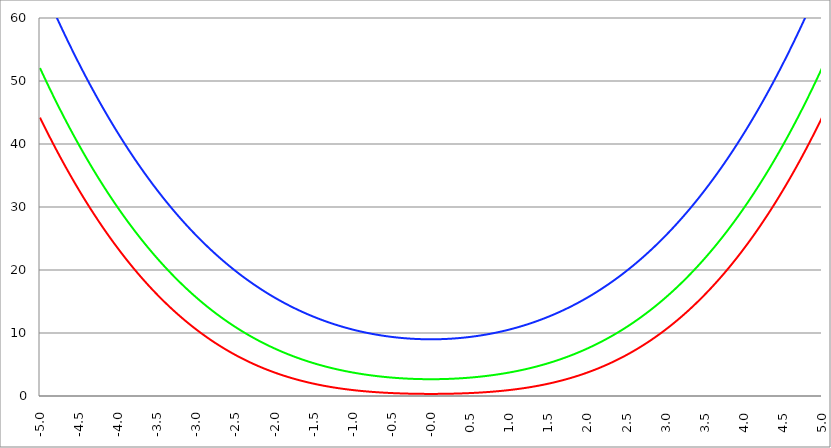
| Category | Series 1 | Series 0 | Series 2 |
|---|---|---|---|
| -5.0 | 44.192 | 52.057 | 66.084 |
| -4.995 | 44.064 | 51.922 | 65.938 |
| -4.99 | 43.937 | 51.788 | 65.793 |
| -4.985 | 43.81 | 51.654 | 65.648 |
| -4.98 | 43.684 | 51.52 | 65.503 |
| -4.975 | 43.557 | 51.387 | 65.358 |
| -4.97 | 43.431 | 51.253 | 65.214 |
| -4.965000000000001 | 43.305 | 51.12 | 65.07 |
| -4.960000000000001 | 43.18 | 50.988 | 64.926 |
| -4.955000000000001 | 43.054 | 50.855 | 64.782 |
| -4.950000000000001 | 42.929 | 50.723 | 64.639 |
| -4.945000000000001 | 42.804 | 50.591 | 64.496 |
| -4.940000000000001 | 42.68 | 50.459 | 64.353 |
| -4.935000000000001 | 42.555 | 50.328 | 64.21 |
| -4.930000000000001 | 42.431 | 50.196 | 64.068 |
| -4.925000000000002 | 42.307 | 50.065 | 63.926 |
| -4.920000000000002 | 42.184 | 49.934 | 63.784 |
| -4.915000000000002 | 42.06 | 49.804 | 63.642 |
| -4.910000000000002 | 41.937 | 49.674 | 63.501 |
| -4.905000000000002 | 41.814 | 49.544 | 63.36 |
| -4.900000000000002 | 41.692 | 49.414 | 63.219 |
| -4.895000000000002 | 41.569 | 49.284 | 63.078 |
| -4.890000000000002 | 41.447 | 49.155 | 62.938 |
| -4.885000000000002 | 41.325 | 49.026 | 62.798 |
| -4.880000000000002 | 41.204 | 48.897 | 62.658 |
| -4.875000000000003 | 41.082 | 48.769 | 62.518 |
| -4.870000000000003 | 40.961 | 48.64 | 62.379 |
| -4.865000000000003 | 40.84 | 48.512 | 62.24 |
| -4.860000000000003 | 40.719 | 48.384 | 62.101 |
| -4.855000000000003 | 40.599 | 48.257 | 61.962 |
| -4.850000000000003 | 40.479 | 48.129 | 61.824 |
| -4.845000000000003 | 40.359 | 48.002 | 61.685 |
| -4.840000000000003 | 40.239 | 47.875 | 61.548 |
| -4.835000000000003 | 40.119 | 47.749 | 61.41 |
| -4.830000000000004 | 40 | 47.622 | 61.272 |
| -4.825000000000004 | 39.881 | 47.496 | 61.135 |
| -4.820000000000004 | 39.762 | 47.37 | 60.998 |
| -4.815000000000004 | 39.644 | 47.245 | 60.862 |
| -4.810000000000004 | 39.526 | 47.119 | 60.725 |
| -4.805000000000004 | 39.408 | 46.994 | 60.589 |
| -4.800000000000004 | 39.29 | 46.869 | 60.453 |
| -4.795000000000004 | 39.172 | 46.745 | 60.317 |
| -4.790000000000004 | 39.055 | 46.62 | 60.182 |
| -4.785000000000004 | 38.938 | 46.496 | 60.046 |
| -4.780000000000004 | 38.821 | 46.372 | 59.911 |
| -4.775000000000004 | 38.704 | 46.248 | 59.777 |
| -4.770000000000004 | 38.588 | 46.125 | 59.642 |
| -4.765000000000005 | 38.472 | 46.002 | 59.508 |
| -4.760000000000005 | 38.356 | 45.879 | 59.374 |
| -4.755000000000005 | 38.24 | 45.756 | 59.24 |
| -4.750000000000005 | 38.125 | 45.633 | 59.107 |
| -4.745000000000005 | 38.01 | 45.511 | 58.973 |
| -4.740000000000005 | 37.895 | 45.389 | 58.84 |
| -4.735000000000005 | 37.78 | 45.267 | 58.707 |
| -4.730000000000005 | 37.666 | 45.146 | 58.575 |
| -4.725000000000006 | 37.552 | 45.024 | 58.442 |
| -4.720000000000006 | 37.438 | 44.903 | 58.31 |
| -4.715000000000006 | 37.324 | 44.782 | 58.178 |
| -4.710000000000006 | 37.21 | 44.662 | 58.047 |
| -4.705000000000006 | 37.097 | 44.541 | 57.915 |
| -4.700000000000006 | 36.984 | 44.421 | 57.784 |
| -4.695000000000006 | 36.871 | 44.301 | 57.653 |
| -4.690000000000006 | 36.759 | 44.182 | 57.523 |
| -4.685000000000007 | 36.646 | 44.062 | 57.392 |
| -4.680000000000007 | 36.534 | 43.943 | 57.262 |
| -4.675000000000007 | 36.422 | 43.824 | 57.132 |
| -4.670000000000007 | 36.311 | 43.705 | 57.002 |
| -4.665000000000007 | 36.199 | 43.587 | 56.873 |
| -4.660000000000007 | 36.088 | 43.468 | 56.744 |
| -4.655000000000007 | 35.977 | 43.35 | 56.615 |
| -4.650000000000007 | 35.867 | 43.233 | 56.486 |
| -4.645000000000007 | 35.756 | 43.115 | 56.357 |
| -4.640000000000008 | 35.646 | 42.998 | 56.229 |
| -4.635000000000008 | 35.536 | 42.881 | 56.101 |
| -4.630000000000008 | 35.426 | 42.764 | 55.973 |
| -4.625000000000008 | 35.317 | 42.647 | 55.846 |
| -4.620000000000008 | 35.207 | 42.531 | 55.718 |
| -4.615000000000008 | 35.098 | 42.414 | 55.591 |
| -4.610000000000008 | 34.989 | 42.299 | 55.464 |
| -4.605000000000008 | 34.881 | 42.183 | 55.337 |
| -4.600000000000008 | 34.772 | 42.067 | 55.211 |
| -4.595000000000009 | 34.664 | 41.952 | 55.085 |
| -4.590000000000009 | 34.556 | 41.837 | 54.959 |
| -4.585000000000009 | 34.449 | 41.722 | 54.833 |
| -4.580000000000009 | 34.341 | 41.608 | 54.708 |
| -4.57500000000001 | 34.234 | 41.493 | 54.582 |
| -4.57000000000001 | 34.127 | 41.379 | 54.457 |
| -4.565000000000009 | 34.02 | 41.265 | 54.333 |
| -4.560000000000009 | 33.913 | 41.152 | 54.208 |
| -4.555000000000009 | 33.807 | 41.038 | 54.084 |
| -4.55000000000001 | 33.701 | 40.925 | 53.96 |
| -4.54500000000001 | 33.595 | 40.812 | 53.836 |
| -4.54000000000001 | 33.49 | 40.699 | 53.712 |
| -4.53500000000001 | 33.384 | 40.587 | 53.589 |
| -4.53000000000001 | 33.279 | 40.475 | 53.465 |
| -4.52500000000001 | 33.174 | 40.363 | 53.342 |
| -4.52000000000001 | 33.069 | 40.251 | 53.22 |
| -4.51500000000001 | 32.965 | 40.139 | 53.097 |
| -4.51000000000001 | 32.86 | 40.028 | 52.975 |
| -4.505000000000011 | 32.756 | 39.917 | 52.853 |
| -4.500000000000011 | 32.653 | 39.806 | 52.731 |
| -4.495000000000011 | 32.549 | 39.695 | 52.61 |
| -4.490000000000011 | 32.446 | 39.585 | 52.488 |
| -4.485000000000011 | 32.342 | 39.474 | 52.367 |
| -4.480000000000011 | 32.239 | 39.364 | 52.246 |
| -4.475000000000011 | 32.137 | 39.255 | 52.126 |
| -4.470000000000011 | 32.034 | 39.145 | 52.005 |
| -4.465000000000011 | 31.932 | 39.036 | 51.885 |
| -4.460000000000011 | 31.83 | 38.927 | 51.765 |
| -4.455000000000012 | 31.728 | 38.818 | 51.645 |
| -4.450000000000012 | 31.627 | 38.709 | 51.526 |
| -4.445000000000012 | 31.525 | 38.601 | 51.406 |
| -4.440000000000012 | 31.424 | 38.492 | 51.287 |
| -4.435000000000012 | 31.323 | 38.384 | 51.168 |
| -4.430000000000012 | 31.222 | 38.277 | 51.05 |
| -4.425000000000012 | 31.122 | 38.169 | 50.931 |
| -4.420000000000012 | 31.022 | 38.062 | 50.813 |
| -4.415000000000012 | 30.922 | 37.955 | 50.695 |
| -4.410000000000013 | 30.822 | 37.848 | 50.578 |
| -4.405000000000013 | 30.722 | 37.741 | 50.46 |
| -4.400000000000013 | 30.623 | 37.635 | 50.343 |
| -4.395000000000013 | 30.524 | 37.528 | 50.226 |
| -4.390000000000013 | 30.425 | 37.422 | 50.109 |
| -4.385000000000013 | 30.326 | 37.317 | 49.992 |
| -4.380000000000013 | 30.228 | 37.211 | 49.876 |
| -4.375000000000013 | 30.129 | 37.106 | 49.76 |
| -4.370000000000013 | 30.031 | 37.001 | 49.644 |
| -4.365000000000013 | 29.933 | 36.896 | 49.528 |
| -4.360000000000014 | 29.836 | 36.791 | 49.413 |
| -4.355000000000014 | 29.738 | 36.687 | 49.297 |
| -4.350000000000014 | 29.641 | 36.582 | 49.182 |
| -4.345000000000014 | 29.544 | 36.478 | 49.068 |
| -4.340000000000014 | 29.447 | 36.375 | 48.953 |
| -4.335000000000014 | 29.351 | 36.271 | 48.839 |
| -4.330000000000014 | 29.255 | 36.168 | 48.725 |
| -4.325000000000014 | 29.158 | 36.064 | 48.611 |
| -4.320000000000014 | 29.063 | 35.961 | 48.497 |
| -4.315000000000015 | 28.967 | 35.859 | 48.383 |
| -4.310000000000015 | 28.871 | 35.756 | 48.27 |
| -4.305000000000015 | 28.776 | 35.654 | 48.157 |
| -4.300000000000015 | 28.681 | 35.552 | 48.044 |
| -4.295000000000015 | 28.586 | 35.45 | 47.932 |
| -4.290000000000015 | 28.492 | 35.348 | 47.819 |
| -4.285000000000015 | 28.397 | 35.247 | 47.707 |
| -4.280000000000015 | 28.303 | 35.146 | 47.595 |
| -4.275000000000015 | 28.209 | 35.045 | 47.483 |
| -4.270000000000015 | 28.116 | 34.944 | 47.372 |
| -4.265000000000016 | 28.022 | 34.843 | 47.26 |
| -4.260000000000016 | 27.929 | 34.743 | 47.149 |
| -4.255000000000016 | 27.836 | 34.643 | 47.038 |
| -4.250000000000016 | 27.743 | 34.543 | 46.928 |
| -4.245000000000016 | 27.65 | 34.443 | 46.817 |
| -4.240000000000016 | 27.558 | 34.344 | 46.707 |
| -4.235000000000016 | 27.465 | 34.245 | 46.597 |
| -4.230000000000016 | 27.373 | 34.146 | 46.487 |
| -4.225000000000017 | 27.281 | 34.047 | 46.378 |
| -4.220000000000017 | 27.19 | 33.948 | 46.268 |
| -4.215000000000017 | 27.098 | 33.85 | 46.159 |
| -4.210000000000017 | 27.007 | 33.751 | 46.05 |
| -4.205000000000017 | 26.916 | 33.653 | 45.942 |
| -4.200000000000017 | 26.825 | 33.556 | 45.833 |
| -4.195000000000017 | 26.735 | 33.458 | 45.725 |
| -4.190000000000017 | 26.645 | 33.361 | 45.617 |
| -4.185000000000017 | 26.554 | 33.263 | 45.509 |
| -4.180000000000017 | 26.465 | 33.166 | 45.401 |
| -4.175000000000018 | 26.375 | 33.07 | 45.294 |
| -4.170000000000018 | 26.285 | 32.973 | 45.187 |
| -4.165000000000018 | 26.196 | 32.877 | 45.08 |
| -4.160000000000018 | 26.107 | 32.781 | 44.973 |
| -4.155000000000018 | 26.018 | 32.685 | 44.866 |
| -4.150000000000018 | 25.929 | 32.589 | 44.76 |
| -4.145000000000018 | 25.841 | 32.494 | 44.654 |
| -4.140000000000018 | 25.753 | 32.398 | 44.548 |
| -4.135000000000018 | 25.664 | 32.303 | 44.442 |
| -4.130000000000019 | 25.577 | 32.208 | 44.337 |
| -4.125000000000019 | 25.489 | 32.114 | 44.231 |
| -4.120000000000019 | 25.402 | 32.019 | 44.126 |
| -4.115000000000019 | 25.314 | 31.925 | 44.021 |
| -4.110000000000019 | 25.227 | 31.831 | 43.917 |
| -4.105000000000019 | 25.14 | 31.737 | 43.812 |
| -4.100000000000019 | 25.054 | 31.644 | 43.708 |
| -4.095000000000019 | 24.967 | 31.55 | 43.604 |
| -4.090000000000019 | 24.881 | 31.457 | 43.5 |
| -4.085000000000019 | 24.795 | 31.364 | 43.396 |
| -4.08000000000002 | 24.709 | 31.271 | 43.293 |
| -4.07500000000002 | 24.624 | 31.179 | 43.19 |
| -4.07000000000002 | 24.538 | 31.086 | 43.087 |
| -4.06500000000002 | 24.453 | 30.994 | 42.984 |
| -4.06000000000002 | 24.368 | 30.902 | 42.881 |
| -4.05500000000002 | 24.284 | 30.81 | 42.779 |
| -4.05000000000002 | 24.199 | 30.719 | 42.677 |
| -4.04500000000002 | 24.115 | 30.627 | 42.575 |
| -4.04000000000002 | 24.03 | 30.536 | 42.473 |
| -4.03500000000002 | 23.946 | 30.445 | 42.372 |
| -4.03000000000002 | 23.863 | 30.355 | 42.27 |
| -4.025000000000021 | 23.779 | 30.264 | 42.169 |
| -4.020000000000021 | 23.696 | 30.174 | 42.068 |
| -4.015000000000021 | 23.613 | 30.083 | 41.968 |
| -4.010000000000021 | 23.53 | 29.994 | 41.867 |
| -4.005000000000021 | 23.447 | 29.904 | 41.767 |
| -4.000000000000021 | 23.364 | 29.814 | 41.667 |
| -3.995000000000021 | 23.282 | 29.725 | 41.567 |
| -3.990000000000021 | 23.2 | 29.636 | 41.467 |
| -3.985000000000022 | 23.118 | 29.547 | 41.368 |
| -3.980000000000022 | 23.036 | 29.458 | 41.268 |
| -3.975000000000022 | 22.954 | 29.37 | 41.169 |
| -3.970000000000022 | 22.873 | 29.281 | 41.07 |
| -3.965000000000022 | 22.792 | 29.193 | 40.972 |
| -3.960000000000022 | 22.711 | 29.105 | 40.873 |
| -3.955000000000022 | 22.63 | 29.017 | 40.775 |
| -3.950000000000022 | 22.55 | 28.93 | 40.677 |
| -3.945000000000022 | 22.469 | 28.842 | 40.579 |
| -3.940000000000023 | 22.389 | 28.755 | 40.481 |
| -3.935000000000023 | 22.309 | 28.668 | 40.384 |
| -3.930000000000023 | 22.229 | 28.582 | 40.287 |
| -3.925000000000023 | 22.15 | 28.495 | 40.19 |
| -3.920000000000023 | 22.07 | 28.409 | 40.093 |
| -3.915000000000023 | 21.991 | 28.323 | 39.996 |
| -3.910000000000023 | 21.912 | 28.237 | 39.9 |
| -3.905000000000023 | 21.833 | 28.151 | 39.803 |
| -3.900000000000023 | 21.755 | 28.065 | 39.707 |
| -3.895000000000023 | 21.676 | 27.98 | 39.612 |
| -3.890000000000024 | 21.598 | 27.895 | 39.516 |
| -3.885000000000024 | 21.52 | 27.81 | 39.42 |
| -3.880000000000024 | 21.442 | 27.725 | 39.325 |
| -3.875000000000024 | 21.365 | 27.64 | 39.23 |
| -3.870000000000024 | 21.287 | 27.556 | 39.135 |
| -3.865000000000024 | 21.21 | 27.472 | 39.041 |
| -3.860000000000024 | 21.133 | 27.388 | 38.946 |
| -3.855000000000024 | 21.056 | 27.304 | 38.852 |
| -3.850000000000024 | 20.979 | 27.22 | 38.758 |
| -3.845000000000025 | 20.903 | 27.137 | 38.664 |
| -3.840000000000025 | 20.827 | 27.054 | 38.57 |
| -3.835000000000025 | 20.75 | 26.971 | 38.477 |
| -3.830000000000025 | 20.675 | 26.888 | 38.384 |
| -3.825000000000025 | 20.599 | 26.805 | 38.291 |
| -3.820000000000025 | 20.523 | 26.723 | 38.198 |
| -3.815000000000025 | 20.448 | 26.641 | 38.105 |
| -3.810000000000025 | 20.373 | 26.558 | 38.013 |
| -3.805000000000025 | 20.298 | 26.477 | 37.92 |
| -3.800000000000026 | 20.223 | 26.395 | 37.828 |
| -3.795000000000026 | 20.149 | 26.313 | 37.736 |
| -3.790000000000026 | 20.074 | 26.232 | 37.645 |
| -3.785000000000026 | 20 | 26.151 | 37.553 |
| -3.780000000000026 | 19.926 | 26.07 | 37.462 |
| -3.775000000000026 | 19.852 | 25.989 | 37.371 |
| -3.770000000000026 | 19.779 | 25.909 | 37.28 |
| -3.765000000000026 | 19.705 | 25.828 | 37.189 |
| -3.760000000000026 | 19.632 | 25.748 | 37.098 |
| -3.755000000000026 | 19.559 | 25.668 | 37.008 |
| -3.750000000000027 | 19.486 | 25.589 | 36.918 |
| -3.745000000000027 | 19.413 | 25.509 | 36.828 |
| -3.740000000000027 | 19.341 | 25.43 | 36.738 |
| -3.735000000000027 | 19.269 | 25.35 | 36.649 |
| -3.730000000000027 | 19.196 | 25.271 | 36.559 |
| -3.725000000000027 | 19.125 | 25.192 | 36.47 |
| -3.720000000000027 | 19.053 | 25.114 | 36.381 |
| -3.715000000000027 | 18.981 | 25.035 | 36.292 |
| -3.710000000000027 | 18.91 | 24.957 | 36.204 |
| -3.705000000000028 | 18.839 | 24.879 | 36.115 |
| -3.700000000000028 | 18.768 | 24.801 | 36.027 |
| -3.695000000000028 | 18.697 | 24.723 | 35.939 |
| -3.690000000000028 | 18.626 | 24.646 | 35.851 |
| -3.685000000000028 | 18.556 | 24.568 | 35.764 |
| -3.680000000000028 | 18.486 | 24.491 | 35.676 |
| -3.675000000000028 | 18.415 | 24.414 | 35.589 |
| -3.670000000000028 | 18.346 | 24.338 | 35.502 |
| -3.665000000000028 | 18.276 | 24.261 | 35.415 |
| -3.660000000000028 | 18.206 | 24.185 | 35.328 |
| -3.655000000000029 | 18.137 | 24.108 | 35.242 |
| -3.650000000000029 | 18.068 | 24.032 | 35.155 |
| -3.645000000000029 | 17.999 | 23.956 | 35.069 |
| -3.640000000000029 | 17.93 | 23.881 | 34.983 |
| -3.635000000000029 | 17.861 | 23.805 | 34.898 |
| -3.630000000000029 | 17.793 | 23.73 | 34.812 |
| -3.625000000000029 | 17.725 | 23.655 | 34.727 |
| -3.620000000000029 | 17.657 | 23.58 | 34.642 |
| -3.615000000000029 | 17.589 | 23.505 | 34.557 |
| -3.61000000000003 | 17.521 | 23.43 | 34.472 |
| -3.60500000000003 | 17.454 | 23.356 | 34.387 |
| -3.60000000000003 | 17.386 | 23.282 | 34.303 |
| -3.59500000000003 | 17.319 | 23.208 | 34.218 |
| -3.59000000000003 | 17.252 | 23.134 | 34.134 |
| -3.58500000000003 | 17.185 | 23.06 | 34.05 |
| -3.58000000000003 | 17.119 | 22.987 | 33.967 |
| -3.57500000000003 | 17.052 | 22.913 | 33.883 |
| -3.57000000000003 | 16.986 | 22.84 | 33.8 |
| -3.565000000000031 | 16.92 | 22.767 | 33.717 |
| -3.560000000000031 | 16.854 | 22.695 | 33.634 |
| -3.555000000000031 | 16.788 | 22.622 | 33.551 |
| -3.550000000000031 | 16.723 | 22.55 | 33.468 |
| -3.545000000000031 | 16.657 | 22.477 | 33.386 |
| -3.540000000000031 | 16.592 | 22.405 | 33.304 |
| -3.535000000000031 | 16.527 | 22.333 | 33.222 |
| -3.530000000000031 | 16.462 | 22.262 | 33.14 |
| -3.525000000000031 | 16.398 | 22.19 | 33.058 |
| -3.520000000000032 | 16.333 | 22.119 | 32.977 |
| -3.515000000000032 | 16.269 | 22.048 | 32.895 |
| -3.510000000000032 | 16.205 | 21.977 | 32.814 |
| -3.505000000000032 | 16.141 | 21.906 | 32.733 |
| -3.500000000000032 | 16.077 | 21.835 | 32.653 |
| -3.495000000000032 | 16.013 | 21.765 | 32.572 |
| -3.490000000000032 | 15.95 | 21.695 | 32.492 |
| -3.485000000000032 | 15.887 | 21.624 | 32.411 |
| -3.480000000000032 | 15.824 | 21.555 | 32.331 |
| -3.475000000000032 | 15.761 | 21.485 | 32.251 |
| -3.470000000000033 | 15.698 | 21.415 | 32.172 |
| -3.465000000000033 | 15.635 | 21.346 | 32.092 |
| -3.460000000000033 | 15.573 | 21.277 | 32.013 |
| -3.455000000000033 | 15.511 | 21.208 | 31.934 |
| -3.450000000000033 | 15.449 | 21.139 | 31.855 |
| -3.445000000000033 | 15.387 | 21.07 | 31.776 |
| -3.440000000000033 | 15.325 | 21.001 | 31.698 |
| -3.435000000000033 | 15.264 | 20.933 | 31.619 |
| -3.430000000000033 | 15.202 | 20.865 | 31.541 |
| -3.425000000000034 | 15.141 | 20.797 | 31.463 |
| -3.420000000000034 | 15.08 | 20.729 | 31.385 |
| -3.415000000000034 | 15.019 | 20.661 | 31.307 |
| -3.410000000000034 | 14.958 | 20.594 | 31.23 |
| -3.405000000000034 | 14.898 | 20.527 | 31.152 |
| -3.400000000000034 | 14.838 | 20.459 | 31.075 |
| -3.395000000000034 | 14.777 | 20.392 | 30.998 |
| -3.390000000000034 | 14.717 | 20.326 | 30.921 |
| -3.385000000000034 | 14.658 | 20.259 | 30.845 |
| -3.380000000000034 | 14.598 | 20.193 | 30.768 |
| -3.375000000000035 | 14.538 | 20.126 | 30.692 |
| -3.370000000000035 | 14.479 | 20.06 | 30.616 |
| -3.365000000000035 | 14.42 | 19.994 | 30.54 |
| -3.360000000000035 | 14.361 | 19.928 | 30.464 |
| -3.355000000000035 | 14.302 | 19.863 | 30.389 |
| -3.350000000000035 | 14.244 | 19.797 | 30.313 |
| -3.345000000000035 | 14.185 | 19.732 | 30.238 |
| -3.340000000000035 | 14.127 | 19.667 | 30.163 |
| -3.335000000000035 | 14.069 | 19.602 | 30.088 |
| -3.330000000000036 | 14.011 | 19.537 | 30.013 |
| -3.325000000000036 | 13.953 | 19.473 | 29.939 |
| -3.320000000000036 | 13.895 | 19.408 | 29.864 |
| -3.315000000000036 | 13.838 | 19.344 | 29.79 |
| -3.310000000000036 | 13.78 | 19.28 | 29.716 |
| -3.305000000000036 | 13.723 | 19.216 | 29.642 |
| -3.300000000000036 | 13.666 | 19.152 | 29.569 |
| -3.295000000000036 | 13.61 | 19.089 | 29.495 |
| -3.290000000000036 | 13.553 | 19.025 | 29.422 |
| -3.285000000000036 | 13.496 | 18.962 | 29.349 |
| -3.280000000000036 | 13.44 | 18.899 | 29.276 |
| -3.275000000000037 | 13.384 | 18.836 | 29.203 |
| -3.270000000000037 | 13.328 | 18.773 | 29.13 |
| -3.265000000000037 | 13.272 | 18.711 | 29.058 |
| -3.260000000000037 | 13.216 | 18.648 | 28.985 |
| -3.255000000000037 | 13.161 | 18.586 | 28.913 |
| -3.250000000000037 | 13.106 | 18.524 | 28.841 |
| -3.245000000000037 | 13.05 | 18.462 | 28.77 |
| -3.240000000000037 | 12.995 | 18.4 | 28.698 |
| -3.235000000000038 | 12.941 | 18.339 | 28.626 |
| -3.230000000000038 | 12.886 | 18.277 | 28.555 |
| -3.225000000000038 | 12.831 | 18.216 | 28.484 |
| -3.220000000000038 | 12.777 | 18.155 | 28.413 |
| -3.215000000000038 | 12.723 | 18.094 | 28.342 |
| -3.210000000000038 | 12.669 | 18.033 | 28.272 |
| -3.205000000000038 | 12.615 | 17.972 | 28.201 |
| -3.200000000000038 | 12.561 | 17.912 | 28.131 |
| -3.195000000000038 | 12.508 | 17.852 | 28.061 |
| -3.190000000000039 | 12.454 | 17.792 | 27.991 |
| -3.185000000000039 | 12.401 | 17.732 | 27.921 |
| -3.180000000000039 | 12.348 | 17.672 | 27.852 |
| -3.175000000000039 | 12.295 | 17.612 | 27.782 |
| -3.170000000000039 | 12.242 | 17.553 | 27.713 |
| -3.16500000000004 | 12.19 | 17.493 | 27.644 |
| -3.16000000000004 | 12.137 | 17.434 | 27.575 |
| -3.155000000000039 | 12.085 | 17.375 | 27.506 |
| -3.150000000000039 | 12.033 | 17.316 | 27.438 |
| -3.14500000000004 | 11.981 | 17.258 | 27.369 |
| -3.14000000000004 | 11.929 | 17.199 | 27.301 |
| -3.13500000000004 | 11.877 | 17.141 | 27.233 |
| -3.13000000000004 | 11.826 | 17.082 | 27.165 |
| -3.12500000000004 | 11.774 | 17.024 | 27.097 |
| -3.12000000000004 | 11.723 | 16.967 | 27.03 |
| -3.11500000000004 | 11.672 | 16.909 | 26.962 |
| -3.11000000000004 | 11.621 | 16.851 | 26.895 |
| -3.10500000000004 | 11.571 | 16.794 | 26.828 |
| -3.10000000000004 | 11.52 | 16.737 | 26.761 |
| -3.095000000000041 | 11.47 | 16.679 | 26.694 |
| -3.090000000000041 | 11.419 | 16.622 | 26.627 |
| -3.085000000000041 | 11.369 | 16.566 | 26.561 |
| -3.080000000000041 | 11.319 | 16.509 | 26.495 |
| -3.075000000000041 | 11.269 | 16.453 | 26.428 |
| -3.070000000000041 | 11.22 | 16.396 | 26.362 |
| -3.065000000000041 | 11.17 | 16.34 | 26.297 |
| -3.060000000000041 | 11.121 | 16.284 | 26.231 |
| -3.055000000000041 | 11.072 | 16.228 | 26.166 |
| -3.050000000000042 | 11.023 | 16.173 | 26.1 |
| -3.045000000000042 | 10.974 | 16.117 | 26.035 |
| -3.040000000000042 | 10.925 | 16.062 | 25.97 |
| -3.035000000000042 | 10.877 | 16.006 | 25.905 |
| -3.030000000000042 | 10.828 | 15.951 | 25.841 |
| -3.025000000000042 | 10.78 | 15.896 | 25.776 |
| -3.020000000000042 | 10.732 | 15.842 | 25.712 |
| -3.015000000000042 | 10.684 | 15.787 | 25.647 |
| -3.010000000000042 | 10.636 | 15.733 | 25.583 |
| -3.005000000000043 | 10.588 | 15.678 | 25.52 |
| -3.000000000000043 | 10.541 | 15.624 | 25.456 |
| -2.995000000000043 | 10.494 | 15.57 | 25.392 |
| -2.990000000000043 | 10.446 | 15.516 | 25.329 |
| -2.985000000000043 | 10.399 | 15.462 | 25.266 |
| -2.980000000000043 | 10.352 | 15.409 | 25.203 |
| -2.975000000000043 | 10.306 | 15.356 | 25.14 |
| -2.970000000000043 | 10.259 | 15.302 | 25.077 |
| -2.965000000000043 | 10.213 | 15.249 | 25.014 |
| -2.960000000000043 | 10.166 | 15.196 | 24.952 |
| -2.955000000000044 | 10.12 | 15.143 | 24.89 |
| -2.950000000000044 | 10.074 | 15.091 | 24.827 |
| -2.945000000000044 | 10.028 | 15.038 | 24.765 |
| -2.940000000000044 | 9.982 | 14.986 | 24.704 |
| -2.935000000000044 | 9.937 | 14.934 | 24.642 |
| -2.930000000000044 | 9.891 | 14.882 | 24.58 |
| -2.925000000000044 | 9.846 | 14.83 | 24.519 |
| -2.920000000000044 | 9.801 | 14.778 | 24.458 |
| -2.915000000000044 | 9.756 | 14.726 | 24.397 |
| -2.910000000000045 | 9.711 | 14.675 | 24.336 |
| -2.905000000000045 | 9.667 | 14.624 | 24.275 |
| -2.900000000000045 | 9.622 | 14.573 | 24.215 |
| -2.895000000000045 | 9.578 | 14.522 | 24.154 |
| -2.890000000000045 | 9.533 | 14.471 | 24.094 |
| -2.885000000000045 | 9.489 | 14.42 | 24.034 |
| -2.880000000000045 | 9.445 | 14.369 | 23.974 |
| -2.875000000000045 | 9.401 | 14.319 | 23.914 |
| -2.870000000000045 | 9.358 | 14.269 | 23.854 |
| -2.865000000000045 | 9.314 | 14.219 | 23.795 |
| -2.860000000000046 | 9.271 | 14.169 | 23.735 |
| -2.855000000000046 | 9.227 | 14.119 | 23.676 |
| -2.850000000000046 | 9.184 | 14.069 | 23.617 |
| -2.845000000000046 | 9.141 | 14.02 | 23.558 |
| -2.840000000000046 | 9.099 | 13.97 | 23.5 |
| -2.835000000000046 | 9.056 | 13.921 | 23.441 |
| -2.830000000000046 | 9.013 | 13.872 | 23.383 |
| -2.825000000000046 | 8.971 | 13.823 | 23.324 |
| -2.820000000000046 | 8.929 | 13.774 | 23.266 |
| -2.815000000000047 | 8.887 | 13.725 | 23.208 |
| -2.810000000000047 | 8.845 | 13.677 | 23.15 |
| -2.805000000000047 | 8.803 | 13.628 | 23.093 |
| -2.800000000000047 | 8.761 | 13.58 | 23.035 |
| -2.795000000000047 | 8.72 | 13.532 | 22.978 |
| -2.790000000000047 | 8.678 | 13.484 | 22.921 |
| -2.785000000000047 | 8.637 | 13.436 | 22.864 |
| -2.780000000000047 | 8.596 | 13.389 | 22.807 |
| -2.775000000000047 | 8.555 | 13.341 | 22.75 |
| -2.770000000000047 | 8.514 | 13.294 | 22.693 |
| -2.765000000000048 | 8.473 | 13.246 | 22.637 |
| -2.760000000000048 | 8.433 | 13.199 | 22.58 |
| -2.755000000000048 | 8.392 | 13.152 | 22.524 |
| -2.750000000000048 | 8.352 | 13.106 | 22.468 |
| -2.745000000000048 | 8.312 | 13.059 | 22.412 |
| -2.740000000000048 | 8.272 | 13.012 | 22.357 |
| -2.735000000000048 | 8.232 | 12.966 | 22.301 |
| -2.730000000000048 | 8.192 | 12.92 | 22.246 |
| -2.725000000000048 | 8.152 | 12.874 | 22.19 |
| -2.720000000000049 | 8.113 | 12.828 | 22.135 |
| -2.715000000000049 | 8.074 | 12.782 | 22.08 |
| -2.710000000000049 | 8.034 | 12.736 | 22.025 |
| -2.705000000000049 | 7.995 | 12.69 | 21.971 |
| -2.700000000000049 | 7.956 | 12.645 | 21.916 |
| -2.695000000000049 | 7.917 | 12.6 | 21.862 |
| -2.690000000000049 | 7.879 | 12.555 | 21.807 |
| -2.685000000000049 | 7.84 | 12.51 | 21.753 |
| -2.680000000000049 | 7.802 | 12.465 | 21.699 |
| -2.675000000000049 | 7.764 | 12.42 | 21.645 |
| -2.67000000000005 | 7.725 | 12.375 | 21.592 |
| -2.66500000000005 | 7.688 | 12.331 | 21.538 |
| -2.66000000000005 | 7.65 | 12.287 | 21.485 |
| -2.65500000000005 | 7.612 | 12.242 | 21.431 |
| -2.65000000000005 | 7.574 | 12.198 | 21.378 |
| -2.64500000000005 | 7.537 | 12.154 | 21.325 |
| -2.64000000000005 | 7.5 | 12.111 | 21.273 |
| -2.63500000000005 | 7.462 | 12.067 | 21.22 |
| -2.63000000000005 | 7.425 | 12.023 | 21.167 |
| -2.625000000000051 | 7.388 | 11.98 | 21.115 |
| -2.620000000000051 | 7.352 | 11.937 | 21.063 |
| -2.615000000000051 | 7.315 | 11.894 | 21.011 |
| -2.610000000000051 | 7.278 | 11.851 | 20.959 |
| -2.605000000000051 | 7.242 | 11.808 | 20.907 |
| -2.600000000000051 | 7.206 | 11.765 | 20.855 |
| -2.595000000000051 | 7.169 | 11.723 | 20.804 |
| -2.590000000000051 | 7.133 | 11.68 | 20.752 |
| -2.585000000000051 | 7.098 | 11.638 | 20.701 |
| -2.580000000000052 | 7.062 | 11.596 | 20.65 |
| -2.575000000000052 | 7.026 | 11.554 | 20.599 |
| -2.570000000000052 | 6.991 | 11.512 | 20.548 |
| -2.565000000000052 | 6.955 | 11.47 | 20.497 |
| -2.560000000000052 | 6.92 | 11.428 | 20.447 |
| -2.555000000000052 | 6.885 | 11.387 | 20.396 |
| -2.550000000000052 | 6.85 | 11.345 | 20.346 |
| -2.545000000000052 | 6.815 | 11.304 | 20.296 |
| -2.540000000000052 | 6.78 | 11.263 | 20.246 |
| -2.535000000000053 | 6.746 | 11.222 | 20.196 |
| -2.530000000000053 | 6.711 | 11.181 | 20.146 |
| -2.525000000000053 | 6.677 | 11.14 | 20.097 |
| -2.520000000000053 | 6.643 | 11.1 | 20.047 |
| -2.515000000000053 | 6.609 | 11.059 | 19.998 |
| -2.510000000000053 | 6.575 | 11.019 | 19.949 |
| -2.505000000000053 | 6.541 | 10.979 | 19.9 |
| -2.500000000000053 | 6.507 | 10.939 | 19.851 |
| -2.495000000000053 | 6.473 | 10.899 | 19.802 |
| -2.490000000000053 | 6.44 | 10.859 | 19.754 |
| -2.485000000000054 | 6.407 | 10.819 | 19.705 |
| -2.480000000000054 | 6.373 | 10.78 | 19.657 |
| -2.475000000000054 | 6.34 | 10.74 | 19.609 |
| -2.470000000000054 | 6.307 | 10.701 | 19.561 |
| -2.465000000000054 | 6.275 | 10.662 | 19.513 |
| -2.460000000000054 | 6.242 | 10.623 | 19.465 |
| -2.455000000000054 | 6.209 | 10.584 | 19.417 |
| -2.450000000000054 | 6.177 | 10.545 | 19.37 |
| -2.445000000000054 | 6.144 | 10.506 | 19.322 |
| -2.440000000000055 | 6.112 | 10.468 | 19.275 |
| -2.435000000000055 | 6.08 | 10.429 | 19.228 |
| -2.430000000000055 | 6.048 | 10.391 | 19.181 |
| -2.425000000000055 | 6.016 | 10.353 | 19.134 |
| -2.420000000000055 | 5.984 | 10.315 | 19.088 |
| -2.415000000000055 | 5.953 | 10.277 | 19.041 |
| -2.410000000000055 | 5.921 | 10.239 | 18.994 |
| -2.405000000000055 | 5.89 | 10.201 | 18.948 |
| -2.400000000000055 | 5.859 | 10.164 | 18.902 |
| -2.395000000000055 | 5.828 | 10.126 | 18.856 |
| -2.390000000000056 | 5.797 | 10.089 | 18.81 |
| -2.385000000000056 | 5.766 | 10.052 | 18.764 |
| -2.380000000000056 | 5.735 | 10.015 | 18.719 |
| -2.375000000000056 | 5.704 | 9.978 | 18.673 |
| -2.370000000000056 | 5.674 | 9.941 | 18.628 |
| -2.365000000000056 | 5.643 | 9.904 | 18.583 |
| -2.360000000000056 | 5.613 | 9.868 | 18.537 |
| -2.355000000000056 | 5.583 | 9.831 | 18.492 |
| -2.350000000000056 | 5.553 | 9.795 | 18.448 |
| -2.345000000000057 | 5.523 | 9.759 | 18.403 |
| -2.340000000000057 | 5.493 | 9.723 | 18.358 |
| -2.335000000000057 | 5.463 | 9.687 | 18.314 |
| -2.330000000000057 | 5.434 | 9.651 | 18.27 |
| -2.325000000000057 | 5.404 | 9.615 | 18.225 |
| -2.320000000000057 | 5.375 | 9.58 | 18.181 |
| -2.315000000000057 | 5.345 | 9.544 | 18.137 |
| -2.310000000000057 | 5.316 | 9.509 | 18.094 |
| -2.305000000000057 | 5.287 | 9.474 | 18.05 |
| -2.300000000000058 | 5.258 | 9.438 | 18.006 |
| -2.295000000000058 | 5.23 | 9.403 | 17.963 |
| -2.290000000000058 | 5.201 | 9.369 | 17.92 |
| -2.285000000000058 | 5.172 | 9.334 | 17.877 |
| -2.280000000000058 | 5.144 | 9.299 | 17.834 |
| -2.275000000000058 | 5.116 | 9.265 | 17.791 |
| -2.270000000000058 | 5.087 | 9.23 | 17.748 |
| -2.265000000000058 | 5.059 | 9.196 | 17.705 |
| -2.260000000000058 | 5.031 | 9.162 | 17.663 |
| -2.255000000000058 | 5.003 | 9.128 | 17.62 |
| -2.250000000000059 | 4.976 | 9.094 | 17.578 |
| -2.245000000000059 | 4.948 | 9.06 | 17.536 |
| -2.240000000000059 | 4.921 | 9.026 | 17.494 |
| -2.235000000000059 | 4.893 | 8.993 | 17.452 |
| -2.23000000000006 | 4.866 | 8.959 | 17.41 |
| -2.22500000000006 | 4.839 | 8.926 | 17.369 |
| -2.22000000000006 | 4.812 | 8.893 | 17.327 |
| -2.215000000000059 | 4.785 | 8.86 | 17.286 |
| -2.210000000000059 | 4.758 | 8.827 | 17.245 |
| -2.20500000000006 | 4.731 | 8.794 | 17.204 |
| -2.20000000000006 | 4.704 | 8.761 | 17.163 |
| -2.19500000000006 | 4.678 | 8.728 | 17.122 |
| -2.19000000000006 | 4.651 | 8.696 | 17.081 |
| -2.18500000000006 | 4.625 | 8.663 | 17.04 |
| -2.18000000000006 | 4.599 | 8.631 | 17 |
| -2.17500000000006 | 4.573 | 8.599 | 16.96 |
| -2.17000000000006 | 4.547 | 8.567 | 16.919 |
| -2.16500000000006 | 4.521 | 8.535 | 16.879 |
| -2.160000000000061 | 4.495 | 8.503 | 16.839 |
| -2.155000000000061 | 4.47 | 8.471 | 16.799 |
| -2.150000000000061 | 4.444 | 8.44 | 16.76 |
| -2.145000000000061 | 4.419 | 8.408 | 16.72 |
| -2.140000000000061 | 4.393 | 8.377 | 16.681 |
| -2.135000000000061 | 4.368 | 8.346 | 16.641 |
| -2.130000000000061 | 4.343 | 8.314 | 16.602 |
| -2.125000000000061 | 4.318 | 8.283 | 16.563 |
| -2.120000000000061 | 4.293 | 8.252 | 16.524 |
| -2.115000000000061 | 4.268 | 8.222 | 16.485 |
| -2.110000000000062 | 4.244 | 8.191 | 16.446 |
| -2.105000000000062 | 4.219 | 8.16 | 16.408 |
| -2.100000000000062 | 4.194 | 8.13 | 16.369 |
| -2.095000000000062 | 4.17 | 8.099 | 16.331 |
| -2.090000000000062 | 4.146 | 8.069 | 16.292 |
| -2.085000000000062 | 4.122 | 8.039 | 16.254 |
| -2.080000000000062 | 4.098 | 8.009 | 16.216 |
| -2.075000000000062 | 4.074 | 7.979 | 16.178 |
| -2.070000000000062 | 4.05 | 7.949 | 16.14 |
| -2.065000000000063 | 4.026 | 7.919 | 16.103 |
| -2.060000000000063 | 4.002 | 7.89 | 16.065 |
| -2.055000000000063 | 3.979 | 7.86 | 16.028 |
| -2.050000000000063 | 3.955 | 7.831 | 15.991 |
| -2.045000000000063 | 3.932 | 7.801 | 15.953 |
| -2.040000000000063 | 3.909 | 7.772 | 15.916 |
| -2.035000000000063 | 3.886 | 7.743 | 15.879 |
| -2.030000000000063 | 3.863 | 7.714 | 15.843 |
| -2.025000000000063 | 3.84 | 7.685 | 15.806 |
| -2.020000000000064 | 3.817 | 7.656 | 15.769 |
| -2.015000000000064 | 3.794 | 7.628 | 15.733 |
| -2.010000000000064 | 3.772 | 7.599 | 15.696 |
| -2.005000000000064 | 3.749 | 7.571 | 15.66 |
| -2.000000000000064 | 3.727 | 7.542 | 15.624 |
| -1.995000000000064 | 3.704 | 7.514 | 15.588 |
| -1.990000000000064 | 3.682 | 7.486 | 15.552 |
| -1.985000000000064 | 3.66 | 7.458 | 15.516 |
| -1.980000000000064 | 3.638 | 7.43 | 15.481 |
| -1.975000000000064 | 3.616 | 7.402 | 15.445 |
| -1.970000000000065 | 3.594 | 7.375 | 15.41 |
| -1.965000000000065 | 3.573 | 7.347 | 15.375 |
| -1.960000000000065 | 3.551 | 7.32 | 15.339 |
| -1.955000000000065 | 3.53 | 7.292 | 15.304 |
| -1.950000000000065 | 3.508 | 7.265 | 15.269 |
| -1.945000000000065 | 3.487 | 7.238 | 15.235 |
| -1.940000000000065 | 3.466 | 7.211 | 15.2 |
| -1.935000000000065 | 3.445 | 7.184 | 15.165 |
| -1.930000000000065 | 3.423 | 7.157 | 15.131 |
| -1.925000000000066 | 3.403 | 7.13 | 15.096 |
| -1.920000000000066 | 3.382 | 7.103 | 15.062 |
| -1.915000000000066 | 3.361 | 7.077 | 15.028 |
| -1.910000000000066 | 3.34 | 7.05 | 14.994 |
| -1.905000000000066 | 3.32 | 7.024 | 14.96 |
| -1.900000000000066 | 3.299 | 6.998 | 14.926 |
| -1.895000000000066 | 3.279 | 6.972 | 14.893 |
| -1.890000000000066 | 3.259 | 6.945 | 14.859 |
| -1.885000000000066 | 3.239 | 6.92 | 14.826 |
| -1.880000000000066 | 3.219 | 6.894 | 14.792 |
| -1.875000000000067 | 3.199 | 6.868 | 14.759 |
| -1.870000000000067 | 3.179 | 6.842 | 14.726 |
| -1.865000000000067 | 3.159 | 6.817 | 14.693 |
| -1.860000000000067 | 3.139 | 6.791 | 14.66 |
| -1.855000000000067 | 3.12 | 6.766 | 14.627 |
| -1.850000000000067 | 3.1 | 6.741 | 14.595 |
| -1.845000000000067 | 3.081 | 6.716 | 14.562 |
| -1.840000000000067 | 3.061 | 6.69 | 14.53 |
| -1.835000000000067 | 3.042 | 6.666 | 14.497 |
| -1.830000000000068 | 3.023 | 6.641 | 14.465 |
| -1.825000000000068 | 3.004 | 6.616 | 14.433 |
| -1.820000000000068 | 2.985 | 6.591 | 14.401 |
| -1.815000000000068 | 2.966 | 6.567 | 14.369 |
| -1.810000000000068 | 2.947 | 6.542 | 14.337 |
| -1.805000000000068 | 2.929 | 6.518 | 14.306 |
| -1.800000000000068 | 2.91 | 6.494 | 14.274 |
| -1.795000000000068 | 2.892 | 6.469 | 14.243 |
| -1.790000000000068 | 2.873 | 6.445 | 14.211 |
| -1.785000000000068 | 2.855 | 6.421 | 14.18 |
| -1.780000000000069 | 2.837 | 6.398 | 14.149 |
| -1.775000000000069 | 2.819 | 6.374 | 14.118 |
| -1.770000000000069 | 2.801 | 6.35 | 14.087 |
| -1.765000000000069 | 2.783 | 6.326 | 14.056 |
| -1.760000000000069 | 2.765 | 6.303 | 14.026 |
| -1.75500000000007 | 2.747 | 6.28 | 13.995 |
| -1.75000000000007 | 2.729 | 6.256 | 13.965 |
| -1.745000000000069 | 2.712 | 6.233 | 13.934 |
| -1.740000000000069 | 2.694 | 6.21 | 13.904 |
| -1.73500000000007 | 2.677 | 6.187 | 13.874 |
| -1.73000000000007 | 2.66 | 6.164 | 13.844 |
| -1.72500000000007 | 2.642 | 6.141 | 13.814 |
| -1.72000000000007 | 2.625 | 6.118 | 13.784 |
| -1.71500000000007 | 2.608 | 6.096 | 13.755 |
| -1.71000000000007 | 2.591 | 6.073 | 13.725 |
| -1.70500000000007 | 2.574 | 6.051 | 13.696 |
| -1.70000000000007 | 2.557 | 6.028 | 13.666 |
| -1.69500000000007 | 2.541 | 6.006 | 13.637 |
| -1.69000000000007 | 2.524 | 5.984 | 13.608 |
| -1.685000000000071 | 2.508 | 5.962 | 13.579 |
| -1.680000000000071 | 2.491 | 5.94 | 13.55 |
| -1.675000000000071 | 2.475 | 5.918 | 13.521 |
| -1.670000000000071 | 2.458 | 5.896 | 13.492 |
| -1.665000000000071 | 2.442 | 5.875 | 13.464 |
| -1.660000000000071 | 2.426 | 5.853 | 13.435 |
| -1.655000000000071 | 2.41 | 5.831 | 13.407 |
| -1.650000000000071 | 2.394 | 5.81 | 13.379 |
| -1.645000000000071 | 2.378 | 5.789 | 13.35 |
| -1.640000000000072 | 2.362 | 5.767 | 13.322 |
| -1.635000000000072 | 2.347 | 5.746 | 13.294 |
| -1.630000000000072 | 2.331 | 5.725 | 13.266 |
| -1.625000000000072 | 2.315 | 5.704 | 13.239 |
| -1.620000000000072 | 2.3 | 5.683 | 13.211 |
| -1.615000000000072 | 2.285 | 5.662 | 13.183 |
| -1.610000000000072 | 2.269 | 5.642 | 13.156 |
| -1.605000000000072 | 2.254 | 5.621 | 13.129 |
| -1.600000000000072 | 2.239 | 5.601 | 13.101 |
| -1.595000000000073 | 2.224 | 5.58 | 13.074 |
| -1.590000000000073 | 2.209 | 5.56 | 13.047 |
| -1.585000000000073 | 2.194 | 5.54 | 13.02 |
| -1.580000000000073 | 2.179 | 5.519 | 12.993 |
| -1.575000000000073 | 2.165 | 5.499 | 12.967 |
| -1.570000000000073 | 2.15 | 5.479 | 12.94 |
| -1.565000000000073 | 2.135 | 5.459 | 12.913 |
| -1.560000000000073 | 2.121 | 5.44 | 12.887 |
| -1.555000000000073 | 2.106 | 5.42 | 12.861 |
| -1.550000000000074 | 2.092 | 5.4 | 12.834 |
| -1.545000000000074 | 2.078 | 5.381 | 12.808 |
| -1.540000000000074 | 2.064 | 5.361 | 12.782 |
| -1.535000000000074 | 2.05 | 5.342 | 12.756 |
| -1.530000000000074 | 2.036 | 5.322 | 12.731 |
| -1.525000000000074 | 2.022 | 5.303 | 12.705 |
| -1.520000000000074 | 2.008 | 5.284 | 12.679 |
| -1.515000000000074 | 1.994 | 5.265 | 12.654 |
| -1.510000000000074 | 1.98 | 5.246 | 12.628 |
| -1.505000000000074 | 1.967 | 5.227 | 12.603 |
| -1.500000000000075 | 1.953 | 5.208 | 12.578 |
| -1.495000000000075 | 1.94 | 5.19 | 12.553 |
| -1.490000000000075 | 1.926 | 5.171 | 12.528 |
| -1.485000000000075 | 1.913 | 5.152 | 12.503 |
| -1.480000000000075 | 1.9 | 5.134 | 12.478 |
| -1.475000000000075 | 1.886 | 5.116 | 12.453 |
| -1.470000000000075 | 1.873 | 5.097 | 12.429 |
| -1.465000000000075 | 1.86 | 5.079 | 12.404 |
| -1.460000000000075 | 1.847 | 5.061 | 12.38 |
| -1.455000000000076 | 1.834 | 5.043 | 12.356 |
| -1.450000000000076 | 1.822 | 5.025 | 12.331 |
| -1.445000000000076 | 1.809 | 5.007 | 12.307 |
| -1.440000000000076 | 1.796 | 4.989 | 12.283 |
| -1.435000000000076 | 1.784 | 4.972 | 12.259 |
| -1.430000000000076 | 1.771 | 4.954 | 12.235 |
| -1.425000000000076 | 1.759 | 4.937 | 12.212 |
| -1.420000000000076 | 1.746 | 4.919 | 12.188 |
| -1.415000000000076 | 1.734 | 4.902 | 12.165 |
| -1.410000000000077 | 1.722 | 4.884 | 12.141 |
| -1.405000000000077 | 1.71 | 4.867 | 12.118 |
| -1.400000000000077 | 1.698 | 4.85 | 12.095 |
| -1.395000000000077 | 1.686 | 4.833 | 12.072 |
| -1.390000000000077 | 1.674 | 4.816 | 12.049 |
| -1.385000000000077 | 1.662 | 4.799 | 12.026 |
| -1.380000000000077 | 1.65 | 4.782 | 12.003 |
| -1.375000000000077 | 1.638 | 4.766 | 11.98 |
| -1.370000000000077 | 1.627 | 4.749 | 11.957 |
| -1.365000000000077 | 1.615 | 4.732 | 11.935 |
| -1.360000000000078 | 1.603 | 4.716 | 11.912 |
| -1.355000000000078 | 1.592 | 4.7 | 11.89 |
| -1.350000000000078 | 1.581 | 4.683 | 11.868 |
| -1.345000000000078 | 1.569 | 4.667 | 11.846 |
| -1.340000000000078 | 1.558 | 4.651 | 11.824 |
| -1.335000000000078 | 1.547 | 4.635 | 11.802 |
| -1.330000000000078 | 1.536 | 4.619 | 11.78 |
| -1.325000000000078 | 1.525 | 4.603 | 11.758 |
| -1.320000000000078 | 1.514 | 4.587 | 11.736 |
| -1.315000000000079 | 1.503 | 4.571 | 11.715 |
| -1.310000000000079 | 1.492 | 4.555 | 11.693 |
| -1.305000000000079 | 1.481 | 4.54 | 11.672 |
| -1.300000000000079 | 1.471 | 4.524 | 11.651 |
| -1.295000000000079 | 1.46 | 4.509 | 11.629 |
| -1.29000000000008 | 1.449 | 4.493 | 11.608 |
| -1.285000000000079 | 1.439 | 4.478 | 11.587 |
| -1.280000000000079 | 1.429 | 4.463 | 11.566 |
| -1.275000000000079 | 1.418 | 4.448 | 11.545 |
| -1.270000000000079 | 1.408 | 4.433 | 11.525 |
| -1.26500000000008 | 1.398 | 4.418 | 11.504 |
| -1.26000000000008 | 1.387 | 4.403 | 11.484 |
| -1.25500000000008 | 1.377 | 4.388 | 11.463 |
| -1.25000000000008 | 1.367 | 4.373 | 11.443 |
| -1.24500000000008 | 1.357 | 4.358 | 11.422 |
| -1.24000000000008 | 1.347 | 4.344 | 11.402 |
| -1.23500000000008 | 1.338 | 4.329 | 11.382 |
| -1.23000000000008 | 1.328 | 4.315 | 11.362 |
| -1.22500000000008 | 1.318 | 4.3 | 11.342 |
| -1.220000000000081 | 1.308 | 4.286 | 11.323 |
| -1.215000000000081 | 1.299 | 4.272 | 11.303 |
| -1.210000000000081 | 1.289 | 4.258 | 11.283 |
| -1.205000000000081 | 1.28 | 4.243 | 11.264 |
| -1.200000000000081 | 1.27 | 4.229 | 11.244 |
| -1.195000000000081 | 1.261 | 4.215 | 11.225 |
| -1.190000000000081 | 1.252 | 4.202 | 11.206 |
| -1.185000000000081 | 1.243 | 4.188 | 11.186 |
| -1.180000000000081 | 1.233 | 4.174 | 11.167 |
| -1.175000000000082 | 1.224 | 4.16 | 11.148 |
| -1.170000000000082 | 1.215 | 4.147 | 11.13 |
| -1.165000000000082 | 1.206 | 4.133 | 11.111 |
| -1.160000000000082 | 1.197 | 4.12 | 11.092 |
| -1.155000000000082 | 1.189 | 4.106 | 11.073 |
| -1.150000000000082 | 1.18 | 4.093 | 11.055 |
| -1.145000000000082 | 1.171 | 4.08 | 11.037 |
| -1.140000000000082 | 1.162 | 4.067 | 11.018 |
| -1.135000000000082 | 1.154 | 4.054 | 11 |
| -1.130000000000082 | 1.145 | 4.041 | 10.982 |
| -1.125000000000083 | 1.137 | 4.028 | 10.964 |
| -1.120000000000083 | 1.128 | 4.015 | 10.946 |
| -1.115000000000083 | 1.12 | 4.002 | 10.928 |
| -1.110000000000083 | 1.112 | 3.989 | 10.91 |
| -1.105000000000083 | 1.103 | 3.977 | 10.892 |
| -1.100000000000083 | 1.095 | 3.964 | 10.875 |
| -1.095000000000083 | 1.087 | 3.951 | 10.857 |
| -1.090000000000083 | 1.079 | 3.939 | 10.84 |
| -1.085000000000083 | 1.071 | 3.927 | 10.822 |
| -1.080000000000084 | 1.063 | 3.914 | 10.805 |
| -1.075000000000084 | 1.055 | 3.902 | 10.788 |
| -1.070000000000084 | 1.047 | 3.89 | 10.771 |
| -1.065000000000084 | 1.039 | 3.878 | 10.754 |
| -1.060000000000084 | 1.032 | 3.866 | 10.737 |
| -1.055000000000084 | 1.024 | 3.854 | 10.72 |
| -1.050000000000084 | 1.016 | 3.842 | 10.703 |
| -1.045000000000084 | 1.009 | 3.83 | 10.687 |
| -1.040000000000084 | 1.001 | 3.818 | 10.67 |
| -1.035000000000085 | 0.994 | 3.807 | 10.654 |
| -1.030000000000085 | 0.986 | 3.795 | 10.637 |
| -1.025000000000085 | 0.979 | 3.784 | 10.621 |
| -1.020000000000085 | 0.972 | 3.772 | 10.605 |
| -1.015000000000085 | 0.964 | 3.761 | 10.589 |
| -1.010000000000085 | 0.957 | 3.749 | 10.573 |
| -1.005000000000085 | 0.95 | 3.738 | 10.557 |
| -1.000000000000085 | 0.943 | 3.727 | 10.541 |
| -0.995000000000085 | 0.936 | 3.716 | 10.525 |
| -0.990000000000085 | 0.929 | 3.705 | 10.509 |
| -0.985000000000085 | 0.922 | 3.694 | 10.494 |
| -0.980000000000085 | 0.915 | 3.683 | 10.478 |
| -0.975000000000085 | 0.908 | 3.672 | 10.463 |
| -0.970000000000085 | 0.901 | 3.661 | 10.448 |
| -0.965000000000085 | 0.895 | 3.65 | 10.432 |
| -0.960000000000085 | 0.888 | 3.639 | 10.417 |
| -0.955000000000085 | 0.881 | 3.629 | 10.402 |
| -0.950000000000085 | 0.875 | 3.618 | 10.387 |
| -0.945000000000085 | 0.868 | 3.608 | 10.372 |
| -0.940000000000085 | 0.862 | 3.597 | 10.357 |
| -0.935000000000085 | 0.855 | 3.587 | 10.343 |
| -0.930000000000085 | 0.849 | 3.577 | 10.328 |
| -0.925000000000085 | 0.843 | 3.567 | 10.313 |
| -0.920000000000085 | 0.836 | 3.556 | 10.299 |
| -0.915000000000085 | 0.83 | 3.546 | 10.285 |
| -0.910000000000085 | 0.824 | 3.536 | 10.27 |
| -0.905000000000085 | 0.818 | 3.526 | 10.256 |
| -0.900000000000085 | 0.812 | 3.516 | 10.242 |
| -0.895000000000085 | 0.806 | 3.507 | 10.228 |
| -0.890000000000085 | 0.8 | 3.497 | 10.214 |
| -0.885000000000085 | 0.794 | 3.487 | 10.2 |
| -0.880000000000085 | 0.788 | 3.477 | 10.186 |
| -0.875000000000085 | 0.782 | 3.468 | 10.173 |
| -0.870000000000085 | 0.776 | 3.458 | 10.159 |
| -0.865000000000085 | 0.771 | 3.449 | 10.145 |
| -0.860000000000085 | 0.765 | 3.439 | 10.132 |
| -0.855000000000085 | 0.759 | 3.43 | 10.119 |
| -0.850000000000085 | 0.754 | 3.421 | 10.105 |
| -0.845000000000085 | 0.748 | 3.412 | 10.092 |
| -0.840000000000085 | 0.742 | 3.403 | 10.079 |
| -0.835000000000085 | 0.737 | 3.393 | 10.066 |
| -0.830000000000085 | 0.732 | 3.384 | 10.053 |
| -0.825000000000085 | 0.726 | 3.375 | 10.04 |
| -0.820000000000085 | 0.721 | 3.367 | 10.027 |
| -0.815000000000085 | 0.716 | 3.358 | 10.015 |
| -0.810000000000085 | 0.71 | 3.349 | 10.002 |
| -0.805000000000085 | 0.705 | 3.34 | 9.989 |
| -0.800000000000085 | 0.7 | 3.332 | 9.977 |
| -0.795000000000085 | 0.695 | 3.323 | 9.964 |
| -0.790000000000085 | 0.69 | 3.315 | 9.952 |
| -0.785000000000085 | 0.685 | 3.306 | 9.94 |
| -0.780000000000085 | 0.68 | 3.298 | 9.928 |
| -0.775000000000085 | 0.675 | 3.289 | 9.916 |
| -0.770000000000085 | 0.67 | 3.281 | 9.904 |
| -0.765000000000085 | 0.665 | 3.273 | 9.892 |
| -0.760000000000085 | 0.661 | 3.265 | 9.88 |
| -0.755000000000085 | 0.656 | 3.257 | 9.868 |
| -0.750000000000085 | 0.651 | 3.249 | 9.857 |
| -0.745000000000085 | 0.646 | 3.241 | 9.845 |
| -0.740000000000085 | 0.642 | 3.233 | 9.834 |
| -0.735000000000085 | 0.637 | 3.225 | 9.822 |
| -0.730000000000085 | 0.633 | 3.217 | 9.811 |
| -0.725000000000085 | 0.628 | 3.209 | 9.8 |
| -0.720000000000085 | 0.624 | 3.202 | 9.789 |
| -0.715000000000085 | 0.619 | 3.194 | 9.778 |
| -0.710000000000085 | 0.615 | 3.186 | 9.767 |
| -0.705000000000085 | 0.611 | 3.179 | 9.756 |
| -0.700000000000085 | 0.606 | 3.171 | 9.745 |
| -0.695000000000085 | 0.602 | 3.164 | 9.734 |
| -0.690000000000085 | 0.598 | 3.157 | 9.724 |
| -0.685000000000085 | 0.594 | 3.149 | 9.713 |
| -0.680000000000085 | 0.589 | 3.142 | 9.702 |
| -0.675000000000085 | 0.585 | 3.135 | 9.692 |
| -0.670000000000085 | 0.581 | 3.128 | 9.682 |
| -0.665000000000085 | 0.577 | 3.121 | 9.671 |
| -0.660000000000085 | 0.573 | 3.114 | 9.661 |
| -0.655000000000085 | 0.569 | 3.107 | 9.651 |
| -0.650000000000085 | 0.566 | 3.1 | 9.641 |
| -0.645000000000085 | 0.562 | 3.093 | 9.631 |
| -0.640000000000085 | 0.558 | 3.087 | 9.621 |
| -0.635000000000085 | 0.554 | 3.08 | 9.612 |
| -0.630000000000085 | 0.55 | 3.073 | 9.602 |
| -0.625000000000085 | 0.547 | 3.067 | 9.592 |
| -0.620000000000085 | 0.543 | 3.06 | 9.583 |
| -0.615000000000085 | 0.539 | 3.054 | 9.573 |
| -0.610000000000085 | 0.536 | 3.047 | 9.564 |
| -0.605000000000085 | 0.532 | 3.041 | 9.555 |
| -0.600000000000085 | 0.529 | 3.035 | 9.545 |
| -0.595000000000085 | 0.525 | 3.028 | 9.536 |
| -0.590000000000085 | 0.522 | 3.022 | 9.527 |
| -0.585000000000085 | 0.518 | 3.016 | 9.518 |
| -0.580000000000085 | 0.515 | 3.01 | 9.509 |
| -0.575000000000085 | 0.512 | 3.004 | 9.5 |
| -0.570000000000085 | 0.508 | 2.998 | 9.492 |
| -0.565000000000085 | 0.505 | 2.992 | 9.483 |
| -0.560000000000085 | 0.502 | 2.986 | 9.474 |
| -0.555000000000085 | 0.499 | 2.981 | 9.466 |
| -0.550000000000085 | 0.496 | 2.975 | 9.458 |
| -0.545000000000085 | 0.492 | 2.969 | 9.449 |
| -0.540000000000085 | 0.489 | 2.964 | 9.441 |
| -0.535000000000085 | 0.486 | 2.958 | 9.433 |
| -0.530000000000085 | 0.483 | 2.952 | 9.425 |
| -0.525000000000085 | 0.48 | 2.947 | 9.417 |
| -0.520000000000085 | 0.477 | 2.942 | 9.409 |
| -0.515000000000085 | 0.474 | 2.936 | 9.401 |
| -0.510000000000085 | 0.472 | 2.931 | 9.393 |
| -0.505000000000085 | 0.469 | 2.926 | 9.385 |
| -0.500000000000085 | 0.466 | 2.921 | 9.378 |
| -0.495000000000085 | 0.463 | 2.915 | 9.37 |
| -0.490000000000085 | 0.46 | 2.91 | 9.363 |
| -0.485000000000085 | 0.458 | 2.905 | 9.355 |
| -0.480000000000085 | 0.455 | 2.9 | 9.348 |
| -0.475000000000085 | 0.452 | 2.895 | 9.341 |
| -0.470000000000085 | 0.45 | 2.891 | 9.333 |
| -0.465000000000085 | 0.447 | 2.886 | 9.326 |
| -0.460000000000085 | 0.445 | 2.881 | 9.319 |
| -0.455000000000085 | 0.442 | 2.876 | 9.312 |
| -0.450000000000085 | 0.44 | 2.872 | 9.305 |
| -0.445000000000085 | 0.437 | 2.867 | 9.299 |
| -0.440000000000085 | 0.435 | 2.863 | 9.292 |
| -0.435000000000085 | 0.432 | 2.858 | 9.285 |
| -0.430000000000085 | 0.43 | 2.854 | 9.279 |
| -0.425000000000085 | 0.428 | 2.849 | 9.272 |
| -0.420000000000085 | 0.425 | 2.845 | 9.266 |
| -0.415000000000085 | 0.423 | 2.841 | 9.26 |
| -0.410000000000085 | 0.421 | 2.837 | 9.253 |
| -0.405000000000085 | 0.419 | 2.832 | 9.247 |
| -0.400000000000085 | 0.416 | 2.828 | 9.241 |
| -0.395000000000085 | 0.414 | 2.824 | 9.235 |
| -0.390000000000085 | 0.412 | 2.82 | 9.229 |
| -0.385000000000085 | 0.41 | 2.816 | 9.223 |
| -0.380000000000085 | 0.408 | 2.812 | 9.217 |
| -0.375000000000085 | 0.406 | 2.809 | 9.212 |
| -0.370000000000085 | 0.404 | 2.805 | 9.206 |
| -0.365000000000085 | 0.402 | 2.801 | 9.201 |
| -0.360000000000085 | 0.4 | 2.797 | 9.195 |
| -0.355000000000085 | 0.398 | 2.794 | 9.19 |
| -0.350000000000085 | 0.396 | 2.79 | 9.184 |
| -0.345000000000085 | 0.395 | 2.787 | 9.179 |
| -0.340000000000085 | 0.393 | 2.783 | 9.174 |
| -0.335000000000085 | 0.391 | 2.78 | 9.169 |
| -0.330000000000085 | 0.389 | 2.776 | 9.164 |
| -0.325000000000085 | 0.388 | 2.773 | 9.159 |
| -0.320000000000085 | 0.386 | 2.77 | 9.154 |
| -0.315000000000085 | 0.384 | 2.767 | 9.149 |
| -0.310000000000085 | 0.383 | 2.763 | 9.145 |
| -0.305000000000085 | 0.381 | 2.76 | 9.14 |
| -0.300000000000085 | 0.379 | 2.757 | 9.135 |
| -0.295000000000085 | 0.378 | 2.754 | 9.131 |
| -0.290000000000085 | 0.376 | 2.751 | 9.126 |
| -0.285000000000085 | 0.375 | 2.748 | 9.122 |
| -0.280000000000085 | 0.373 | 2.745 | 9.118 |
| -0.275000000000085 | 0.372 | 2.743 | 9.114 |
| -0.270000000000085 | 0.37 | 2.74 | 9.11 |
| -0.265000000000085 | 0.369 | 2.737 | 9.106 |
| -0.260000000000085 | 0.368 | 2.735 | 9.102 |
| -0.255000000000085 | 0.366 | 2.732 | 9.098 |
| -0.250000000000085 | 0.365 | 2.729 | 9.094 |
| -0.245000000000085 | 0.364 | 2.727 | 9.09 |
| -0.240000000000085 | 0.363 | 2.724 | 9.087 |
| -0.235000000000085 | 0.361 | 2.722 | 9.083 |
| -0.230000000000085 | 0.36 | 2.72 | 9.079 |
| -0.225000000000085 | 0.359 | 2.717 | 9.076 |
| -0.220000000000085 | 0.358 | 2.715 | 9.073 |
| -0.215000000000085 | 0.357 | 2.713 | 9.069 |
| -0.210000000000085 | 0.356 | 2.711 | 9.066 |
| -0.205000000000085 | 0.355 | 2.709 | 9.063 |
| -0.200000000000085 | 0.354 | 2.707 | 9.06 |
| -0.195000000000085 | 0.353 | 2.705 | 9.057 |
| -0.190000000000085 | 0.352 | 2.703 | 9.054 |
| -0.185000000000085 | 0.351 | 2.701 | 9.051 |
| -0.180000000000085 | 0.35 | 2.699 | 9.049 |
| -0.175000000000085 | 0.349 | 2.697 | 9.046 |
| -0.170000000000085 | 0.348 | 2.696 | 9.043 |
| -0.165000000000085 | 0.347 | 2.694 | 9.041 |
| -0.160000000000085 | 0.346 | 2.692 | 9.038 |
| -0.155000000000084 | 0.345 | 2.691 | 9.036 |
| -0.150000000000084 | 0.345 | 2.689 | 9.034 |
| -0.145000000000084 | 0.344 | 2.688 | 9.032 |
| -0.140000000000084 | 0.343 | 2.686 | 9.029 |
| -0.135000000000084 | 0.342 | 2.685 | 9.027 |
| -0.130000000000084 | 0.342 | 2.684 | 9.025 |
| -0.125000000000084 | 0.341 | 2.682 | 9.023 |
| -0.120000000000084 | 0.341 | 2.681 | 9.022 |
| -0.115000000000084 | 0.34 | 2.68 | 9.02 |
| -0.110000000000084 | 0.339 | 2.679 | 9.018 |
| -0.105000000000084 | 0.339 | 2.678 | 9.017 |
| -0.100000000000084 | 0.338 | 2.677 | 9.015 |
| -0.0950000000000844 | 0.338 | 2.676 | 9.014 |
| -0.0900000000000844 | 0.337 | 2.675 | 9.012 |
| -0.0850000000000844 | 0.337 | 2.674 | 9.011 |
| -0.0800000000000844 | 0.337 | 2.673 | 9.01 |
| -0.0750000000000844 | 0.336 | 2.672 | 9.008 |
| -0.0700000000000844 | 0.336 | 2.672 | 9.007 |
| -0.0650000000000844 | 0.335 | 2.671 | 9.006 |
| -0.0600000000000844 | 0.335 | 2.67 | 9.005 |
| -0.0550000000000844 | 0.335 | 2.67 | 9.005 |
| -0.0500000000000844 | 0.335 | 2.669 | 9.004 |
| -0.0450000000000844 | 0.334 | 2.669 | 9.003 |
| -0.0400000000000844 | 0.334 | 2.668 | 9.002 |
| -0.0350000000000844 | 0.334 | 2.668 | 9.002 |
| -0.0300000000000844 | 0.334 | 2.668 | 9.001 |
| -0.0250000000000844 | 0.334 | 2.667 | 9.001 |
| -0.0200000000000844 | 0.334 | 2.667 | 9.001 |
| -0.0150000000000844 | 0.333 | 2.667 | 9 |
| -0.0100000000000844 | 0.333 | 2.667 | 9 |
| -0.00500000000008444 | 0.333 | 2.667 | 9 |
| -8.4444604087075e-14 | 0.333 | 2.667 | 9 |
| 0.00499999999991555 | 0.333 | 2.667 | 9 |
| 0.00999999999991555 | 0.333 | 2.667 | 9 |
| 0.0149999999999156 | 0.333 | 2.667 | 9 |
| 0.0199999999999156 | 0.334 | 2.667 | 9.001 |
| 0.0249999999999156 | 0.334 | 2.667 | 9.001 |
| 0.0299999999999156 | 0.334 | 2.668 | 9.001 |
| 0.0349999999999155 | 0.334 | 2.668 | 9.002 |
| 0.0399999999999155 | 0.334 | 2.668 | 9.002 |
| 0.0449999999999155 | 0.334 | 2.669 | 9.003 |
| 0.0499999999999155 | 0.335 | 2.669 | 9.004 |
| 0.0549999999999155 | 0.335 | 2.67 | 9.005 |
| 0.0599999999999155 | 0.335 | 2.67 | 9.005 |
| 0.0649999999999155 | 0.335 | 2.671 | 9.006 |
| 0.0699999999999155 | 0.336 | 2.672 | 9.007 |
| 0.0749999999999155 | 0.336 | 2.672 | 9.008 |
| 0.0799999999999155 | 0.337 | 2.673 | 9.01 |
| 0.0849999999999155 | 0.337 | 2.674 | 9.011 |
| 0.0899999999999155 | 0.337 | 2.675 | 9.012 |
| 0.0949999999999155 | 0.338 | 2.676 | 9.014 |
| 0.0999999999999155 | 0.338 | 2.677 | 9.015 |
| 0.104999999999916 | 0.339 | 2.678 | 9.017 |
| 0.109999999999916 | 0.339 | 2.679 | 9.018 |
| 0.114999999999916 | 0.34 | 2.68 | 9.02 |
| 0.119999999999916 | 0.341 | 2.681 | 9.022 |
| 0.124999999999916 | 0.341 | 2.682 | 9.023 |
| 0.129999999999916 | 0.342 | 2.684 | 9.025 |
| 0.134999999999916 | 0.342 | 2.685 | 9.027 |
| 0.139999999999916 | 0.343 | 2.686 | 9.029 |
| 0.144999999999916 | 0.344 | 2.688 | 9.032 |
| 0.149999999999916 | 0.345 | 2.689 | 9.034 |
| 0.154999999999916 | 0.345 | 2.691 | 9.036 |
| 0.159999999999916 | 0.346 | 2.692 | 9.038 |
| 0.164999999999916 | 0.347 | 2.694 | 9.041 |
| 0.169999999999916 | 0.348 | 2.696 | 9.043 |
| 0.174999999999916 | 0.349 | 2.697 | 9.046 |
| 0.179999999999916 | 0.35 | 2.699 | 9.049 |
| 0.184999999999916 | 0.351 | 2.701 | 9.051 |
| 0.189999999999916 | 0.352 | 2.703 | 9.054 |
| 0.194999999999916 | 0.353 | 2.705 | 9.057 |
| 0.199999999999916 | 0.354 | 2.707 | 9.06 |
| 0.204999999999916 | 0.355 | 2.709 | 9.063 |
| 0.209999999999916 | 0.356 | 2.711 | 9.066 |
| 0.214999999999916 | 0.357 | 2.713 | 9.069 |
| 0.219999999999916 | 0.358 | 2.715 | 9.073 |
| 0.224999999999916 | 0.359 | 2.717 | 9.076 |
| 0.229999999999916 | 0.36 | 2.72 | 9.079 |
| 0.234999999999916 | 0.361 | 2.722 | 9.083 |
| 0.239999999999916 | 0.363 | 2.724 | 9.087 |
| 0.244999999999916 | 0.364 | 2.727 | 9.09 |
| 0.249999999999916 | 0.365 | 2.729 | 9.094 |
| 0.254999999999916 | 0.366 | 2.732 | 9.098 |
| 0.259999999999916 | 0.368 | 2.735 | 9.102 |
| 0.264999999999916 | 0.369 | 2.737 | 9.106 |
| 0.269999999999916 | 0.37 | 2.74 | 9.11 |
| 0.274999999999916 | 0.372 | 2.743 | 9.114 |
| 0.279999999999916 | 0.373 | 2.745 | 9.118 |
| 0.284999999999916 | 0.375 | 2.748 | 9.122 |
| 0.289999999999916 | 0.376 | 2.751 | 9.126 |
| 0.294999999999916 | 0.378 | 2.754 | 9.131 |
| 0.299999999999916 | 0.379 | 2.757 | 9.135 |
| 0.304999999999916 | 0.381 | 2.76 | 9.14 |
| 0.309999999999916 | 0.383 | 2.763 | 9.145 |
| 0.314999999999916 | 0.384 | 2.767 | 9.149 |
| 0.319999999999916 | 0.386 | 2.77 | 9.154 |
| 0.324999999999916 | 0.388 | 2.773 | 9.159 |
| 0.329999999999916 | 0.389 | 2.776 | 9.164 |
| 0.334999999999916 | 0.391 | 2.78 | 9.169 |
| 0.339999999999916 | 0.393 | 2.783 | 9.174 |
| 0.344999999999916 | 0.395 | 2.787 | 9.179 |
| 0.349999999999916 | 0.396 | 2.79 | 9.184 |
| 0.354999999999916 | 0.398 | 2.794 | 9.19 |
| 0.359999999999916 | 0.4 | 2.797 | 9.195 |
| 0.364999999999916 | 0.402 | 2.801 | 9.201 |
| 0.369999999999916 | 0.404 | 2.805 | 9.206 |
| 0.374999999999916 | 0.406 | 2.809 | 9.212 |
| 0.379999999999916 | 0.408 | 2.812 | 9.217 |
| 0.384999999999916 | 0.41 | 2.816 | 9.223 |
| 0.389999999999916 | 0.412 | 2.82 | 9.229 |
| 0.394999999999916 | 0.414 | 2.824 | 9.235 |
| 0.399999999999916 | 0.416 | 2.828 | 9.241 |
| 0.404999999999916 | 0.419 | 2.832 | 9.247 |
| 0.409999999999916 | 0.421 | 2.837 | 9.253 |
| 0.414999999999916 | 0.423 | 2.841 | 9.26 |
| 0.419999999999916 | 0.425 | 2.845 | 9.266 |
| 0.424999999999916 | 0.428 | 2.849 | 9.272 |
| 0.429999999999916 | 0.43 | 2.854 | 9.279 |
| 0.434999999999916 | 0.432 | 2.858 | 9.285 |
| 0.439999999999916 | 0.435 | 2.863 | 9.292 |
| 0.444999999999916 | 0.437 | 2.867 | 9.299 |
| 0.449999999999916 | 0.44 | 2.872 | 9.305 |
| 0.454999999999916 | 0.442 | 2.876 | 9.312 |
| 0.459999999999916 | 0.445 | 2.881 | 9.319 |
| 0.464999999999916 | 0.447 | 2.886 | 9.326 |
| 0.469999999999916 | 0.45 | 2.891 | 9.333 |
| 0.474999999999916 | 0.452 | 2.895 | 9.341 |
| 0.479999999999916 | 0.455 | 2.9 | 9.348 |
| 0.484999999999916 | 0.458 | 2.905 | 9.355 |
| 0.489999999999916 | 0.46 | 2.91 | 9.363 |
| 0.494999999999916 | 0.463 | 2.915 | 9.37 |
| 0.499999999999916 | 0.466 | 2.921 | 9.378 |
| 0.504999999999916 | 0.469 | 2.926 | 9.385 |
| 0.509999999999916 | 0.472 | 2.931 | 9.393 |
| 0.514999999999916 | 0.474 | 2.936 | 9.401 |
| 0.519999999999916 | 0.477 | 2.942 | 9.409 |
| 0.524999999999916 | 0.48 | 2.947 | 9.417 |
| 0.529999999999916 | 0.483 | 2.952 | 9.425 |
| 0.534999999999916 | 0.486 | 2.958 | 9.433 |
| 0.539999999999916 | 0.489 | 2.964 | 9.441 |
| 0.544999999999916 | 0.492 | 2.969 | 9.449 |
| 0.549999999999916 | 0.496 | 2.975 | 9.458 |
| 0.554999999999916 | 0.499 | 2.981 | 9.466 |
| 0.559999999999916 | 0.502 | 2.986 | 9.474 |
| 0.564999999999916 | 0.505 | 2.992 | 9.483 |
| 0.569999999999916 | 0.508 | 2.998 | 9.492 |
| 0.574999999999916 | 0.512 | 3.004 | 9.5 |
| 0.579999999999916 | 0.515 | 3.01 | 9.509 |
| 0.584999999999916 | 0.518 | 3.016 | 9.518 |
| 0.589999999999916 | 0.522 | 3.022 | 9.527 |
| 0.594999999999916 | 0.525 | 3.028 | 9.536 |
| 0.599999999999916 | 0.529 | 3.035 | 9.545 |
| 0.604999999999916 | 0.532 | 3.041 | 9.555 |
| 0.609999999999916 | 0.536 | 3.047 | 9.564 |
| 0.614999999999916 | 0.539 | 3.054 | 9.573 |
| 0.619999999999916 | 0.543 | 3.06 | 9.583 |
| 0.624999999999916 | 0.547 | 3.067 | 9.592 |
| 0.629999999999916 | 0.55 | 3.073 | 9.602 |
| 0.634999999999916 | 0.554 | 3.08 | 9.612 |
| 0.639999999999916 | 0.558 | 3.087 | 9.621 |
| 0.644999999999916 | 0.562 | 3.093 | 9.631 |
| 0.649999999999916 | 0.566 | 3.1 | 9.641 |
| 0.654999999999916 | 0.569 | 3.107 | 9.651 |
| 0.659999999999916 | 0.573 | 3.114 | 9.661 |
| 0.664999999999916 | 0.577 | 3.121 | 9.671 |
| 0.669999999999916 | 0.581 | 3.128 | 9.682 |
| 0.674999999999916 | 0.585 | 3.135 | 9.692 |
| 0.679999999999916 | 0.589 | 3.142 | 9.702 |
| 0.684999999999916 | 0.594 | 3.149 | 9.713 |
| 0.689999999999916 | 0.598 | 3.157 | 9.724 |
| 0.694999999999916 | 0.602 | 3.164 | 9.734 |
| 0.699999999999916 | 0.606 | 3.171 | 9.745 |
| 0.704999999999916 | 0.611 | 3.179 | 9.756 |
| 0.709999999999916 | 0.615 | 3.186 | 9.767 |
| 0.714999999999916 | 0.619 | 3.194 | 9.778 |
| 0.719999999999916 | 0.624 | 3.202 | 9.789 |
| 0.724999999999916 | 0.628 | 3.209 | 9.8 |
| 0.729999999999916 | 0.633 | 3.217 | 9.811 |
| 0.734999999999916 | 0.637 | 3.225 | 9.822 |
| 0.739999999999916 | 0.642 | 3.233 | 9.834 |
| 0.744999999999916 | 0.646 | 3.241 | 9.845 |
| 0.749999999999916 | 0.651 | 3.249 | 9.857 |
| 0.754999999999916 | 0.656 | 3.257 | 9.868 |
| 0.759999999999916 | 0.661 | 3.265 | 9.88 |
| 0.764999999999916 | 0.665 | 3.273 | 9.892 |
| 0.769999999999916 | 0.67 | 3.281 | 9.904 |
| 0.774999999999916 | 0.675 | 3.289 | 9.916 |
| 0.779999999999916 | 0.68 | 3.298 | 9.928 |
| 0.784999999999916 | 0.685 | 3.306 | 9.94 |
| 0.789999999999916 | 0.69 | 3.315 | 9.952 |
| 0.794999999999916 | 0.695 | 3.323 | 9.964 |
| 0.799999999999916 | 0.7 | 3.332 | 9.977 |
| 0.804999999999916 | 0.705 | 3.34 | 9.989 |
| 0.809999999999916 | 0.71 | 3.349 | 10.002 |
| 0.814999999999916 | 0.716 | 3.358 | 10.015 |
| 0.819999999999916 | 0.721 | 3.367 | 10.027 |
| 0.824999999999916 | 0.726 | 3.375 | 10.04 |
| 0.829999999999916 | 0.732 | 3.384 | 10.053 |
| 0.834999999999916 | 0.737 | 3.393 | 10.066 |
| 0.839999999999916 | 0.742 | 3.403 | 10.079 |
| 0.844999999999916 | 0.748 | 3.412 | 10.092 |
| 0.849999999999916 | 0.754 | 3.421 | 10.105 |
| 0.854999999999916 | 0.759 | 3.43 | 10.119 |
| 0.859999999999916 | 0.765 | 3.439 | 10.132 |
| 0.864999999999916 | 0.771 | 3.449 | 10.145 |
| 0.869999999999916 | 0.776 | 3.458 | 10.159 |
| 0.874999999999916 | 0.782 | 3.468 | 10.173 |
| 0.879999999999916 | 0.788 | 3.477 | 10.186 |
| 0.884999999999916 | 0.794 | 3.487 | 10.2 |
| 0.889999999999916 | 0.8 | 3.497 | 10.214 |
| 0.894999999999916 | 0.806 | 3.507 | 10.228 |
| 0.899999999999916 | 0.812 | 3.516 | 10.242 |
| 0.904999999999916 | 0.818 | 3.526 | 10.256 |
| 0.909999999999916 | 0.824 | 3.536 | 10.27 |
| 0.914999999999916 | 0.83 | 3.546 | 10.285 |
| 0.919999999999916 | 0.836 | 3.556 | 10.299 |
| 0.924999999999916 | 0.843 | 3.567 | 10.313 |
| 0.929999999999916 | 0.849 | 3.577 | 10.328 |
| 0.934999999999916 | 0.855 | 3.587 | 10.343 |
| 0.939999999999916 | 0.862 | 3.597 | 10.357 |
| 0.944999999999916 | 0.868 | 3.608 | 10.372 |
| 0.949999999999916 | 0.875 | 3.618 | 10.387 |
| 0.954999999999916 | 0.881 | 3.629 | 10.402 |
| 0.959999999999916 | 0.888 | 3.639 | 10.417 |
| 0.964999999999916 | 0.895 | 3.65 | 10.432 |
| 0.969999999999916 | 0.901 | 3.661 | 10.448 |
| 0.974999999999916 | 0.908 | 3.672 | 10.463 |
| 0.979999999999916 | 0.915 | 3.683 | 10.478 |
| 0.984999999999916 | 0.922 | 3.694 | 10.494 |
| 0.989999999999916 | 0.929 | 3.705 | 10.509 |
| 0.994999999999916 | 0.936 | 3.716 | 10.525 |
| 0.999999999999916 | 0.943 | 3.727 | 10.541 |
| 1.004999999999916 | 0.95 | 3.738 | 10.557 |
| 1.009999999999916 | 0.957 | 3.749 | 10.573 |
| 1.014999999999916 | 0.964 | 3.761 | 10.589 |
| 1.019999999999916 | 0.972 | 3.772 | 10.605 |
| 1.024999999999916 | 0.979 | 3.784 | 10.621 |
| 1.029999999999916 | 0.986 | 3.795 | 10.637 |
| 1.034999999999916 | 0.994 | 3.807 | 10.654 |
| 1.039999999999915 | 1.001 | 3.818 | 10.67 |
| 1.044999999999915 | 1.009 | 3.83 | 10.687 |
| 1.049999999999915 | 1.016 | 3.842 | 10.703 |
| 1.054999999999915 | 1.024 | 3.854 | 10.72 |
| 1.059999999999915 | 1.032 | 3.866 | 10.737 |
| 1.064999999999915 | 1.039 | 3.878 | 10.754 |
| 1.069999999999915 | 1.047 | 3.89 | 10.771 |
| 1.074999999999915 | 1.055 | 3.902 | 10.788 |
| 1.079999999999915 | 1.063 | 3.914 | 10.805 |
| 1.084999999999914 | 1.071 | 3.927 | 10.822 |
| 1.089999999999914 | 1.079 | 3.939 | 10.84 |
| 1.094999999999914 | 1.087 | 3.951 | 10.857 |
| 1.099999999999914 | 1.095 | 3.964 | 10.875 |
| 1.104999999999914 | 1.103 | 3.977 | 10.892 |
| 1.109999999999914 | 1.112 | 3.989 | 10.91 |
| 1.114999999999914 | 1.12 | 4.002 | 10.928 |
| 1.119999999999914 | 1.128 | 4.015 | 10.946 |
| 1.124999999999914 | 1.137 | 4.028 | 10.964 |
| 1.129999999999914 | 1.145 | 4.041 | 10.982 |
| 1.134999999999913 | 1.154 | 4.054 | 11 |
| 1.139999999999913 | 1.162 | 4.067 | 11.018 |
| 1.144999999999913 | 1.171 | 4.08 | 11.037 |
| 1.149999999999913 | 1.18 | 4.093 | 11.055 |
| 1.154999999999913 | 1.189 | 4.106 | 11.073 |
| 1.159999999999913 | 1.197 | 4.12 | 11.092 |
| 1.164999999999913 | 1.206 | 4.133 | 11.111 |
| 1.169999999999913 | 1.215 | 4.147 | 11.13 |
| 1.174999999999913 | 1.224 | 4.16 | 11.148 |
| 1.179999999999912 | 1.233 | 4.174 | 11.167 |
| 1.184999999999912 | 1.243 | 4.188 | 11.186 |
| 1.189999999999912 | 1.252 | 4.202 | 11.206 |
| 1.194999999999912 | 1.261 | 4.215 | 11.225 |
| 1.199999999999912 | 1.27 | 4.229 | 11.244 |
| 1.204999999999912 | 1.28 | 4.243 | 11.264 |
| 1.209999999999912 | 1.289 | 4.258 | 11.283 |
| 1.214999999999912 | 1.299 | 4.272 | 11.303 |
| 1.219999999999912 | 1.308 | 4.286 | 11.323 |
| 1.224999999999911 | 1.318 | 4.3 | 11.342 |
| 1.229999999999911 | 1.328 | 4.315 | 11.362 |
| 1.234999999999911 | 1.338 | 4.329 | 11.382 |
| 1.239999999999911 | 1.347 | 4.344 | 11.402 |
| 1.244999999999911 | 1.357 | 4.358 | 11.422 |
| 1.249999999999911 | 1.367 | 4.373 | 11.443 |
| 1.254999999999911 | 1.377 | 4.388 | 11.463 |
| 1.259999999999911 | 1.387 | 4.403 | 11.484 |
| 1.264999999999911 | 1.398 | 4.418 | 11.504 |
| 1.269999999999911 | 1.408 | 4.433 | 11.525 |
| 1.27499999999991 | 1.418 | 4.448 | 11.545 |
| 1.27999999999991 | 1.429 | 4.463 | 11.566 |
| 1.28499999999991 | 1.439 | 4.478 | 11.587 |
| 1.28999999999991 | 1.449 | 4.493 | 11.608 |
| 1.29499999999991 | 1.46 | 4.509 | 11.629 |
| 1.29999999999991 | 1.471 | 4.524 | 11.651 |
| 1.30499999999991 | 1.481 | 4.54 | 11.672 |
| 1.30999999999991 | 1.492 | 4.555 | 11.693 |
| 1.31499999999991 | 1.503 | 4.571 | 11.715 |
| 1.319999999999909 | 1.514 | 4.587 | 11.736 |
| 1.324999999999909 | 1.525 | 4.603 | 11.758 |
| 1.329999999999909 | 1.536 | 4.619 | 11.78 |
| 1.334999999999909 | 1.547 | 4.635 | 11.802 |
| 1.339999999999909 | 1.558 | 4.651 | 11.824 |
| 1.344999999999909 | 1.569 | 4.667 | 11.846 |
| 1.349999999999909 | 1.581 | 4.683 | 11.868 |
| 1.354999999999909 | 1.592 | 4.7 | 11.89 |
| 1.359999999999909 | 1.603 | 4.716 | 11.912 |
| 1.364999999999908 | 1.615 | 4.732 | 11.935 |
| 1.369999999999908 | 1.627 | 4.749 | 11.957 |
| 1.374999999999908 | 1.638 | 4.766 | 11.98 |
| 1.379999999999908 | 1.65 | 4.782 | 12.003 |
| 1.384999999999908 | 1.662 | 4.799 | 12.026 |
| 1.389999999999908 | 1.674 | 4.816 | 12.049 |
| 1.394999999999908 | 1.686 | 4.833 | 12.072 |
| 1.399999999999908 | 1.698 | 4.85 | 12.095 |
| 1.404999999999908 | 1.71 | 4.867 | 12.118 |
| 1.409999999999908 | 1.722 | 4.884 | 12.141 |
| 1.414999999999907 | 1.734 | 4.902 | 12.165 |
| 1.419999999999907 | 1.746 | 4.919 | 12.188 |
| 1.424999999999907 | 1.759 | 4.937 | 12.212 |
| 1.429999999999907 | 1.771 | 4.954 | 12.235 |
| 1.434999999999907 | 1.784 | 4.972 | 12.259 |
| 1.439999999999907 | 1.796 | 4.989 | 12.283 |
| 1.444999999999907 | 1.809 | 5.007 | 12.307 |
| 1.449999999999907 | 1.822 | 5.025 | 12.331 |
| 1.454999999999907 | 1.834 | 5.043 | 12.356 |
| 1.459999999999906 | 1.847 | 5.061 | 12.38 |
| 1.464999999999906 | 1.86 | 5.079 | 12.404 |
| 1.469999999999906 | 1.873 | 5.097 | 12.429 |
| 1.474999999999906 | 1.886 | 5.116 | 12.453 |
| 1.479999999999906 | 1.9 | 5.134 | 12.478 |
| 1.484999999999906 | 1.913 | 5.152 | 12.503 |
| 1.489999999999906 | 1.926 | 5.171 | 12.528 |
| 1.494999999999906 | 1.94 | 5.19 | 12.553 |
| 1.499999999999906 | 1.953 | 5.208 | 12.578 |
| 1.504999999999906 | 1.967 | 5.227 | 12.603 |
| 1.509999999999905 | 1.98 | 5.246 | 12.628 |
| 1.514999999999905 | 1.994 | 5.265 | 12.654 |
| 1.519999999999905 | 2.008 | 5.284 | 12.679 |
| 1.524999999999905 | 2.022 | 5.303 | 12.705 |
| 1.529999999999905 | 2.036 | 5.322 | 12.731 |
| 1.534999999999905 | 2.05 | 5.342 | 12.756 |
| 1.539999999999905 | 2.064 | 5.361 | 12.782 |
| 1.544999999999905 | 2.078 | 5.381 | 12.808 |
| 1.549999999999905 | 2.092 | 5.4 | 12.834 |
| 1.554999999999904 | 2.106 | 5.42 | 12.861 |
| 1.559999999999904 | 2.121 | 5.44 | 12.887 |
| 1.564999999999904 | 2.135 | 5.459 | 12.913 |
| 1.569999999999904 | 2.15 | 5.479 | 12.94 |
| 1.574999999999904 | 2.165 | 5.499 | 12.967 |
| 1.579999999999904 | 2.179 | 5.519 | 12.993 |
| 1.584999999999904 | 2.194 | 5.54 | 13.02 |
| 1.589999999999904 | 2.209 | 5.56 | 13.047 |
| 1.594999999999904 | 2.224 | 5.58 | 13.074 |
| 1.599999999999903 | 2.239 | 5.601 | 13.101 |
| 1.604999999999903 | 2.254 | 5.621 | 13.129 |
| 1.609999999999903 | 2.269 | 5.642 | 13.156 |
| 1.614999999999903 | 2.285 | 5.662 | 13.183 |
| 1.619999999999903 | 2.3 | 5.683 | 13.211 |
| 1.624999999999903 | 2.315 | 5.704 | 13.239 |
| 1.629999999999903 | 2.331 | 5.725 | 13.266 |
| 1.634999999999903 | 2.347 | 5.746 | 13.294 |
| 1.639999999999903 | 2.362 | 5.767 | 13.322 |
| 1.644999999999902 | 2.378 | 5.789 | 13.35 |
| 1.649999999999902 | 2.394 | 5.81 | 13.379 |
| 1.654999999999902 | 2.41 | 5.831 | 13.407 |
| 1.659999999999902 | 2.426 | 5.853 | 13.435 |
| 1.664999999999902 | 2.442 | 5.875 | 13.464 |
| 1.669999999999902 | 2.458 | 5.896 | 13.492 |
| 1.674999999999902 | 2.475 | 5.918 | 13.521 |
| 1.679999999999902 | 2.491 | 5.94 | 13.55 |
| 1.684999999999902 | 2.508 | 5.962 | 13.579 |
| 1.689999999999901 | 2.524 | 5.984 | 13.608 |
| 1.694999999999901 | 2.541 | 6.006 | 13.637 |
| 1.699999999999901 | 2.557 | 6.028 | 13.666 |
| 1.704999999999901 | 2.574 | 6.051 | 13.696 |
| 1.709999999999901 | 2.591 | 6.073 | 13.725 |
| 1.714999999999901 | 2.608 | 6.096 | 13.755 |
| 1.719999999999901 | 2.625 | 6.118 | 13.784 |
| 1.724999999999901 | 2.642 | 6.141 | 13.814 |
| 1.729999999999901 | 2.66 | 6.164 | 13.844 |
| 1.734999999999901 | 2.677 | 6.187 | 13.874 |
| 1.7399999999999 | 2.694 | 6.21 | 13.904 |
| 1.7449999999999 | 2.712 | 6.233 | 13.934 |
| 1.7499999999999 | 2.729 | 6.256 | 13.965 |
| 1.7549999999999 | 2.747 | 6.28 | 13.995 |
| 1.7599999999999 | 2.765 | 6.303 | 14.026 |
| 1.7649999999999 | 2.783 | 6.326 | 14.056 |
| 1.7699999999999 | 2.801 | 6.35 | 14.087 |
| 1.7749999999999 | 2.819 | 6.374 | 14.118 |
| 1.7799999999999 | 2.837 | 6.398 | 14.149 |
| 1.784999999999899 | 2.855 | 6.421 | 14.18 |
| 1.789999999999899 | 2.873 | 6.445 | 14.211 |
| 1.794999999999899 | 2.892 | 6.469 | 14.243 |
| 1.799999999999899 | 2.91 | 6.494 | 14.274 |
| 1.804999999999899 | 2.929 | 6.518 | 14.306 |
| 1.809999999999899 | 2.947 | 6.542 | 14.337 |
| 1.814999999999899 | 2.966 | 6.567 | 14.369 |
| 1.819999999999899 | 2.985 | 6.591 | 14.401 |
| 1.824999999999899 | 3.004 | 6.616 | 14.433 |
| 1.829999999999899 | 3.023 | 6.641 | 14.465 |
| 1.834999999999898 | 3.042 | 6.666 | 14.497 |
| 1.839999999999898 | 3.061 | 6.69 | 14.53 |
| 1.844999999999898 | 3.081 | 6.716 | 14.562 |
| 1.849999999999898 | 3.1 | 6.741 | 14.595 |
| 1.854999999999898 | 3.12 | 6.766 | 14.627 |
| 1.859999999999898 | 3.139 | 6.791 | 14.66 |
| 1.864999999999898 | 3.159 | 6.817 | 14.693 |
| 1.869999999999898 | 3.179 | 6.842 | 14.726 |
| 1.874999999999898 | 3.199 | 6.868 | 14.759 |
| 1.879999999999897 | 3.219 | 6.894 | 14.792 |
| 1.884999999999897 | 3.239 | 6.92 | 14.826 |
| 1.889999999999897 | 3.259 | 6.945 | 14.859 |
| 1.894999999999897 | 3.279 | 6.972 | 14.893 |
| 1.899999999999897 | 3.299 | 6.998 | 14.926 |
| 1.904999999999897 | 3.32 | 7.024 | 14.96 |
| 1.909999999999897 | 3.34 | 7.05 | 14.994 |
| 1.914999999999897 | 3.361 | 7.077 | 15.028 |
| 1.919999999999897 | 3.382 | 7.103 | 15.062 |
| 1.924999999999897 | 3.403 | 7.13 | 15.096 |
| 1.929999999999896 | 3.423 | 7.157 | 15.131 |
| 1.934999999999896 | 3.445 | 7.184 | 15.165 |
| 1.939999999999896 | 3.466 | 7.211 | 15.2 |
| 1.944999999999896 | 3.487 | 7.238 | 15.235 |
| 1.949999999999896 | 3.508 | 7.265 | 15.269 |
| 1.954999999999896 | 3.53 | 7.292 | 15.304 |
| 1.959999999999896 | 3.551 | 7.32 | 15.339 |
| 1.964999999999896 | 3.573 | 7.347 | 15.375 |
| 1.969999999999896 | 3.594 | 7.375 | 15.41 |
| 1.974999999999895 | 3.616 | 7.402 | 15.445 |
| 1.979999999999895 | 3.638 | 7.43 | 15.481 |
| 1.984999999999895 | 3.66 | 7.458 | 15.516 |
| 1.989999999999895 | 3.682 | 7.486 | 15.552 |
| 1.994999999999895 | 3.704 | 7.514 | 15.588 |
| 1.999999999999895 | 3.727 | 7.542 | 15.624 |
| 2.004999999999895 | 3.749 | 7.571 | 15.66 |
| 2.009999999999895 | 3.772 | 7.599 | 15.696 |
| 2.014999999999895 | 3.794 | 7.628 | 15.733 |
| 2.019999999999895 | 3.817 | 7.656 | 15.769 |
| 2.024999999999895 | 3.84 | 7.685 | 15.806 |
| 2.029999999999895 | 3.863 | 7.714 | 15.843 |
| 2.034999999999894 | 3.886 | 7.743 | 15.879 |
| 2.039999999999894 | 3.909 | 7.772 | 15.916 |
| 2.044999999999894 | 3.932 | 7.801 | 15.953 |
| 2.049999999999894 | 3.955 | 7.831 | 15.991 |
| 2.054999999999894 | 3.979 | 7.86 | 16.028 |
| 2.059999999999894 | 4.002 | 7.89 | 16.065 |
| 2.064999999999894 | 4.026 | 7.919 | 16.103 |
| 2.069999999999894 | 4.05 | 7.949 | 16.14 |
| 2.074999999999894 | 4.074 | 7.979 | 16.178 |
| 2.079999999999893 | 4.098 | 8.009 | 16.216 |
| 2.084999999999893 | 4.122 | 8.039 | 16.254 |
| 2.089999999999893 | 4.146 | 8.069 | 16.292 |
| 2.094999999999893 | 4.17 | 8.099 | 16.331 |
| 2.099999999999893 | 4.194 | 8.13 | 16.369 |
| 2.104999999999893 | 4.219 | 8.16 | 16.408 |
| 2.109999999999893 | 4.244 | 8.191 | 16.446 |
| 2.114999999999893 | 4.268 | 8.222 | 16.485 |
| 2.119999999999893 | 4.293 | 8.252 | 16.524 |
| 2.124999999999893 | 4.318 | 8.283 | 16.563 |
| 2.129999999999892 | 4.343 | 8.314 | 16.602 |
| 2.134999999999892 | 4.368 | 8.346 | 16.641 |
| 2.139999999999892 | 4.393 | 8.377 | 16.681 |
| 2.144999999999892 | 4.419 | 8.408 | 16.72 |
| 2.149999999999892 | 4.444 | 8.44 | 16.76 |
| 2.154999999999892 | 4.47 | 8.471 | 16.799 |
| 2.159999999999892 | 4.495 | 8.503 | 16.839 |
| 2.164999999999892 | 4.521 | 8.535 | 16.879 |
| 2.169999999999892 | 4.547 | 8.567 | 16.919 |
| 2.174999999999891 | 4.573 | 8.599 | 16.96 |
| 2.179999999999891 | 4.599 | 8.631 | 17 |
| 2.184999999999891 | 4.625 | 8.663 | 17.04 |
| 2.189999999999891 | 4.651 | 8.696 | 17.081 |
| 2.194999999999891 | 4.678 | 8.728 | 17.122 |
| 2.199999999999891 | 4.704 | 8.761 | 17.163 |
| 2.204999999999891 | 4.731 | 8.794 | 17.204 |
| 2.209999999999891 | 4.758 | 8.827 | 17.245 |
| 2.214999999999891 | 4.785 | 8.86 | 17.286 |
| 2.21999999999989 | 4.812 | 8.893 | 17.327 |
| 2.22499999999989 | 4.839 | 8.926 | 17.369 |
| 2.22999999999989 | 4.866 | 8.959 | 17.41 |
| 2.23499999999989 | 4.893 | 8.993 | 17.452 |
| 2.23999999999989 | 4.921 | 9.026 | 17.494 |
| 2.24499999999989 | 4.948 | 9.06 | 17.536 |
| 2.24999999999989 | 4.976 | 9.094 | 17.578 |
| 2.25499999999989 | 5.003 | 9.128 | 17.62 |
| 2.25999999999989 | 5.031 | 9.162 | 17.663 |
| 2.26499999999989 | 5.059 | 9.196 | 17.705 |
| 2.269999999999889 | 5.087 | 9.23 | 17.748 |
| 2.274999999999889 | 5.116 | 9.265 | 17.791 |
| 2.279999999999889 | 5.144 | 9.299 | 17.834 |
| 2.284999999999889 | 5.172 | 9.334 | 17.877 |
| 2.289999999999889 | 5.201 | 9.369 | 17.92 |
| 2.294999999999889 | 5.23 | 9.403 | 17.963 |
| 2.299999999999889 | 5.258 | 9.438 | 18.006 |
| 2.304999999999889 | 5.287 | 9.474 | 18.05 |
| 2.309999999999889 | 5.316 | 9.509 | 18.094 |
| 2.314999999999888 | 5.345 | 9.544 | 18.137 |
| 2.319999999999888 | 5.375 | 9.58 | 18.181 |
| 2.324999999999888 | 5.404 | 9.615 | 18.225 |
| 2.329999999999888 | 5.434 | 9.651 | 18.27 |
| 2.334999999999888 | 5.463 | 9.687 | 18.314 |
| 2.339999999999888 | 5.493 | 9.723 | 18.358 |
| 2.344999999999888 | 5.523 | 9.759 | 18.403 |
| 2.349999999999888 | 5.553 | 9.795 | 18.448 |
| 2.354999999999888 | 5.583 | 9.831 | 18.492 |
| 2.359999999999887 | 5.613 | 9.868 | 18.537 |
| 2.364999999999887 | 5.643 | 9.904 | 18.583 |
| 2.369999999999887 | 5.674 | 9.941 | 18.628 |
| 2.374999999999887 | 5.704 | 9.978 | 18.673 |
| 2.379999999999887 | 5.735 | 10.015 | 18.719 |
| 2.384999999999887 | 5.766 | 10.052 | 18.764 |
| 2.389999999999887 | 5.797 | 10.089 | 18.81 |
| 2.394999999999887 | 5.828 | 10.126 | 18.856 |
| 2.399999999999887 | 5.859 | 10.164 | 18.902 |
| 2.404999999999887 | 5.89 | 10.201 | 18.948 |
| 2.409999999999886 | 5.921 | 10.239 | 18.994 |
| 2.414999999999886 | 5.953 | 10.277 | 19.041 |
| 2.419999999999886 | 5.984 | 10.315 | 19.088 |
| 2.424999999999886 | 6.016 | 10.353 | 19.134 |
| 2.429999999999886 | 6.048 | 10.391 | 19.181 |
| 2.434999999999886 | 6.08 | 10.429 | 19.228 |
| 2.439999999999886 | 6.112 | 10.468 | 19.275 |
| 2.444999999999886 | 6.144 | 10.506 | 19.322 |
| 2.449999999999886 | 6.177 | 10.545 | 19.37 |
| 2.454999999999885 | 6.209 | 10.584 | 19.417 |
| 2.459999999999885 | 6.242 | 10.623 | 19.465 |
| 2.464999999999885 | 6.275 | 10.662 | 19.513 |
| 2.469999999999885 | 6.307 | 10.701 | 19.561 |
| 2.474999999999885 | 6.34 | 10.74 | 19.609 |
| 2.479999999999885 | 6.373 | 10.78 | 19.657 |
| 2.484999999999885 | 6.407 | 10.819 | 19.705 |
| 2.489999999999885 | 6.44 | 10.859 | 19.754 |
| 2.494999999999885 | 6.473 | 10.899 | 19.802 |
| 2.499999999999884 | 6.507 | 10.939 | 19.851 |
| 2.504999999999884 | 6.541 | 10.979 | 19.9 |
| 2.509999999999884 | 6.575 | 11.019 | 19.949 |
| 2.514999999999884 | 6.609 | 11.059 | 19.998 |
| 2.519999999999884 | 6.643 | 11.1 | 20.047 |
| 2.524999999999884 | 6.677 | 11.14 | 20.097 |
| 2.529999999999884 | 6.711 | 11.181 | 20.146 |
| 2.534999999999884 | 6.746 | 11.222 | 20.196 |
| 2.539999999999884 | 6.78 | 11.263 | 20.246 |
| 2.544999999999884 | 6.815 | 11.304 | 20.296 |
| 2.549999999999883 | 6.85 | 11.345 | 20.346 |
| 2.554999999999883 | 6.885 | 11.387 | 20.396 |
| 2.559999999999883 | 6.92 | 11.428 | 20.447 |
| 2.564999999999883 | 6.955 | 11.47 | 20.497 |
| 2.569999999999883 | 6.991 | 11.512 | 20.548 |
| 2.574999999999883 | 7.026 | 11.554 | 20.599 |
| 2.579999999999883 | 7.062 | 11.596 | 20.65 |
| 2.584999999999883 | 7.098 | 11.638 | 20.701 |
| 2.589999999999883 | 7.133 | 11.68 | 20.752 |
| 2.594999999999882 | 7.169 | 11.723 | 20.804 |
| 2.599999999999882 | 7.206 | 11.765 | 20.855 |
| 2.604999999999882 | 7.242 | 11.808 | 20.907 |
| 2.609999999999882 | 7.278 | 11.851 | 20.959 |
| 2.614999999999882 | 7.315 | 11.894 | 21.011 |
| 2.619999999999882 | 7.352 | 11.937 | 21.063 |
| 2.624999999999882 | 7.388 | 11.98 | 21.115 |
| 2.629999999999882 | 7.425 | 12.023 | 21.167 |
| 2.634999999999882 | 7.462 | 12.067 | 21.22 |
| 2.639999999999881 | 7.5 | 12.111 | 21.273 |
| 2.644999999999881 | 7.537 | 12.154 | 21.325 |
| 2.649999999999881 | 7.574 | 12.198 | 21.378 |
| 2.654999999999881 | 7.612 | 12.242 | 21.431 |
| 2.659999999999881 | 7.65 | 12.287 | 21.485 |
| 2.664999999999881 | 7.688 | 12.331 | 21.538 |
| 2.669999999999881 | 7.725 | 12.375 | 21.592 |
| 2.674999999999881 | 7.764 | 12.42 | 21.645 |
| 2.679999999999881 | 7.802 | 12.465 | 21.699 |
| 2.68499999999988 | 7.84 | 12.51 | 21.753 |
| 2.68999999999988 | 7.879 | 12.555 | 21.807 |
| 2.69499999999988 | 7.917 | 12.6 | 21.862 |
| 2.69999999999988 | 7.956 | 12.645 | 21.916 |
| 2.70499999999988 | 7.995 | 12.69 | 21.971 |
| 2.70999999999988 | 8.034 | 12.736 | 22.025 |
| 2.71499999999988 | 8.074 | 12.782 | 22.08 |
| 2.71999999999988 | 8.113 | 12.828 | 22.135 |
| 2.72499999999988 | 8.152 | 12.874 | 22.19 |
| 2.72999999999988 | 8.192 | 12.92 | 22.246 |
| 2.734999999999879 | 8.232 | 12.966 | 22.301 |
| 2.739999999999879 | 8.272 | 13.012 | 22.357 |
| 2.744999999999879 | 8.312 | 13.059 | 22.412 |
| 2.749999999999879 | 8.352 | 13.106 | 22.468 |
| 2.754999999999879 | 8.392 | 13.152 | 22.524 |
| 2.759999999999879 | 8.433 | 13.199 | 22.58 |
| 2.764999999999879 | 8.473 | 13.246 | 22.637 |
| 2.769999999999879 | 8.514 | 13.294 | 22.693 |
| 2.774999999999879 | 8.555 | 13.341 | 22.75 |
| 2.779999999999878 | 8.596 | 13.389 | 22.807 |
| 2.784999999999878 | 8.637 | 13.436 | 22.864 |
| 2.789999999999878 | 8.678 | 13.484 | 22.921 |
| 2.794999999999878 | 8.72 | 13.532 | 22.978 |
| 2.799999999999878 | 8.761 | 13.58 | 23.035 |
| 2.804999999999878 | 8.803 | 13.628 | 23.093 |
| 2.809999999999878 | 8.845 | 13.677 | 23.15 |
| 2.814999999999878 | 8.887 | 13.725 | 23.208 |
| 2.819999999999878 | 8.929 | 13.774 | 23.266 |
| 2.824999999999878 | 8.971 | 13.823 | 23.324 |
| 2.829999999999877 | 9.013 | 13.872 | 23.383 |
| 2.834999999999877 | 9.056 | 13.921 | 23.441 |
| 2.839999999999877 | 9.099 | 13.97 | 23.5 |
| 2.844999999999877 | 9.141 | 14.02 | 23.558 |
| 2.849999999999877 | 9.184 | 14.069 | 23.617 |
| 2.854999999999877 | 9.227 | 14.119 | 23.676 |
| 2.859999999999877 | 9.271 | 14.169 | 23.735 |
| 2.864999999999877 | 9.314 | 14.219 | 23.795 |
| 2.869999999999877 | 9.358 | 14.269 | 23.854 |
| 2.874999999999876 | 9.401 | 14.319 | 23.914 |
| 2.879999999999876 | 9.445 | 14.369 | 23.974 |
| 2.884999999999876 | 9.489 | 14.42 | 24.034 |
| 2.889999999999876 | 9.533 | 14.471 | 24.094 |
| 2.894999999999876 | 9.578 | 14.522 | 24.154 |
| 2.899999999999876 | 9.622 | 14.573 | 24.215 |
| 2.904999999999876 | 9.667 | 14.624 | 24.275 |
| 2.909999999999876 | 9.711 | 14.675 | 24.336 |
| 2.914999999999876 | 9.756 | 14.726 | 24.397 |
| 2.919999999999876 | 9.801 | 14.778 | 24.458 |
| 2.924999999999875 | 9.846 | 14.83 | 24.519 |
| 2.929999999999875 | 9.891 | 14.882 | 24.58 |
| 2.934999999999875 | 9.937 | 14.934 | 24.642 |
| 2.939999999999875 | 9.982 | 14.986 | 24.704 |
| 2.944999999999875 | 10.028 | 15.038 | 24.765 |
| 2.949999999999875 | 10.074 | 15.091 | 24.827 |
| 2.954999999999875 | 10.12 | 15.143 | 24.89 |
| 2.959999999999875 | 10.166 | 15.196 | 24.952 |
| 2.964999999999875 | 10.213 | 15.249 | 25.014 |
| 2.969999999999874 | 10.259 | 15.302 | 25.077 |
| 2.974999999999874 | 10.306 | 15.356 | 25.14 |
| 2.979999999999874 | 10.352 | 15.409 | 25.203 |
| 2.984999999999874 | 10.399 | 15.462 | 25.266 |
| 2.989999999999874 | 10.446 | 15.516 | 25.329 |
| 2.994999999999874 | 10.494 | 15.57 | 25.392 |
| 2.999999999999874 | 10.541 | 15.624 | 25.456 |
| 3.004999999999874 | 10.588 | 15.678 | 25.52 |
| 3.009999999999874 | 10.636 | 15.733 | 25.583 |
| 3.014999999999874 | 10.684 | 15.787 | 25.647 |
| 3.019999999999873 | 10.732 | 15.842 | 25.712 |
| 3.024999999999873 | 10.78 | 15.896 | 25.776 |
| 3.029999999999873 | 10.828 | 15.951 | 25.841 |
| 3.034999999999873 | 10.877 | 16.006 | 25.905 |
| 3.039999999999873 | 10.925 | 16.062 | 25.97 |
| 3.044999999999873 | 10.974 | 16.117 | 26.035 |
| 3.049999999999873 | 11.023 | 16.173 | 26.1 |
| 3.054999999999873 | 11.072 | 16.228 | 26.166 |
| 3.059999999999873 | 11.121 | 16.284 | 26.231 |
| 3.064999999999872 | 11.17 | 16.34 | 26.297 |
| 3.069999999999872 | 11.22 | 16.396 | 26.362 |
| 3.074999999999872 | 11.269 | 16.453 | 26.428 |
| 3.079999999999872 | 11.319 | 16.509 | 26.495 |
| 3.084999999999872 | 11.369 | 16.566 | 26.561 |
| 3.089999999999872 | 11.419 | 16.622 | 26.627 |
| 3.094999999999872 | 11.47 | 16.679 | 26.694 |
| 3.099999999999872 | 11.52 | 16.737 | 26.761 |
| 3.104999999999872 | 11.571 | 16.794 | 26.828 |
| 3.109999999999872 | 11.621 | 16.851 | 26.895 |
| 3.114999999999871 | 11.672 | 16.909 | 26.962 |
| 3.119999999999871 | 11.723 | 16.967 | 27.03 |
| 3.124999999999871 | 11.774 | 17.024 | 27.097 |
| 3.129999999999871 | 11.826 | 17.082 | 27.165 |
| 3.134999999999871 | 11.877 | 17.141 | 27.233 |
| 3.139999999999871 | 11.929 | 17.199 | 27.301 |
| 3.144999999999871 | 11.981 | 17.258 | 27.369 |
| 3.149999999999871 | 12.033 | 17.316 | 27.438 |
| 3.154999999999871 | 12.085 | 17.375 | 27.506 |
| 3.15999999999987 | 12.137 | 17.434 | 27.575 |
| 3.16499999999987 | 12.19 | 17.493 | 27.644 |
| 3.16999999999987 | 12.242 | 17.553 | 27.713 |
| 3.17499999999987 | 12.295 | 17.612 | 27.782 |
| 3.17999999999987 | 12.348 | 17.672 | 27.852 |
| 3.18499999999987 | 12.401 | 17.732 | 27.921 |
| 3.18999999999987 | 12.454 | 17.792 | 27.991 |
| 3.19499999999987 | 12.508 | 17.852 | 28.061 |
| 3.19999999999987 | 12.561 | 17.912 | 28.131 |
| 3.204999999999869 | 12.615 | 17.972 | 28.201 |
| 3.209999999999869 | 12.669 | 18.033 | 28.272 |
| 3.214999999999869 | 12.723 | 18.094 | 28.342 |
| 3.219999999999869 | 12.777 | 18.155 | 28.413 |
| 3.224999999999869 | 12.831 | 18.216 | 28.484 |
| 3.229999999999869 | 12.886 | 18.277 | 28.555 |
| 3.234999999999869 | 12.941 | 18.339 | 28.626 |
| 3.239999999999869 | 12.995 | 18.4 | 28.698 |
| 3.244999999999869 | 13.05 | 18.462 | 28.77 |
| 3.249999999999869 | 13.106 | 18.524 | 28.841 |
| 3.254999999999868 | 13.161 | 18.586 | 28.913 |
| 3.259999999999868 | 13.216 | 18.648 | 28.985 |
| 3.264999999999868 | 13.272 | 18.711 | 29.058 |
| 3.269999999999868 | 13.328 | 18.773 | 29.13 |
| 3.274999999999868 | 13.384 | 18.836 | 29.203 |
| 3.279999999999868 | 13.44 | 18.899 | 29.276 |
| 3.284999999999868 | 13.496 | 18.962 | 29.349 |
| 3.289999999999868 | 13.553 | 19.025 | 29.422 |
| 3.294999999999868 | 13.61 | 19.089 | 29.495 |
| 3.299999999999867 | 13.666 | 19.152 | 29.569 |
| 3.304999999999867 | 13.723 | 19.216 | 29.642 |
| 3.309999999999867 | 13.78 | 19.28 | 29.716 |
| 3.314999999999867 | 13.838 | 19.344 | 29.79 |
| 3.319999999999867 | 13.895 | 19.408 | 29.864 |
| 3.324999999999867 | 13.953 | 19.473 | 29.939 |
| 3.329999999999867 | 14.011 | 19.537 | 30.013 |
| 3.334999999999867 | 14.069 | 19.602 | 30.088 |
| 3.339999999999867 | 14.127 | 19.667 | 30.163 |
| 3.344999999999866 | 14.185 | 19.732 | 30.238 |
| 3.349999999999866 | 14.244 | 19.797 | 30.313 |
| 3.354999999999866 | 14.302 | 19.863 | 30.389 |
| 3.359999999999866 | 14.361 | 19.928 | 30.464 |
| 3.364999999999866 | 14.42 | 19.994 | 30.54 |
| 3.369999999999866 | 14.479 | 20.06 | 30.616 |
| 3.374999999999866 | 14.538 | 20.126 | 30.692 |
| 3.379999999999866 | 14.598 | 20.193 | 30.768 |
| 3.384999999999866 | 14.658 | 20.259 | 30.845 |
| 3.389999999999866 | 14.717 | 20.326 | 30.921 |
| 3.394999999999865 | 14.777 | 20.392 | 30.998 |
| 3.399999999999865 | 14.838 | 20.459 | 31.075 |
| 3.404999999999865 | 14.898 | 20.527 | 31.152 |
| 3.409999999999865 | 14.958 | 20.594 | 31.23 |
| 3.414999999999865 | 15.019 | 20.661 | 31.307 |
| 3.419999999999865 | 15.08 | 20.729 | 31.385 |
| 3.424999999999865 | 15.141 | 20.797 | 31.463 |
| 3.429999999999865 | 15.202 | 20.865 | 31.541 |
| 3.434999999999865 | 15.264 | 20.933 | 31.619 |
| 3.439999999999864 | 15.325 | 21.001 | 31.698 |
| 3.444999999999864 | 15.387 | 21.07 | 31.776 |
| 3.449999999999864 | 15.449 | 21.139 | 31.855 |
| 3.454999999999864 | 15.511 | 21.208 | 31.934 |
| 3.459999999999864 | 15.573 | 21.277 | 32.013 |
| 3.464999999999864 | 15.635 | 21.346 | 32.092 |
| 3.469999999999864 | 15.698 | 21.415 | 32.172 |
| 3.474999999999864 | 15.761 | 21.485 | 32.251 |
| 3.479999999999864 | 15.824 | 21.555 | 32.331 |
| 3.484999999999864 | 15.887 | 21.624 | 32.411 |
| 3.489999999999863 | 15.95 | 21.695 | 32.492 |
| 3.494999999999863 | 16.013 | 21.765 | 32.572 |
| 3.499999999999863 | 16.077 | 21.835 | 32.653 |
| 3.504999999999863 | 16.141 | 21.906 | 32.733 |
| 3.509999999999863 | 16.205 | 21.977 | 32.814 |
| 3.514999999999863 | 16.269 | 22.048 | 32.895 |
| 3.519999999999863 | 16.333 | 22.119 | 32.977 |
| 3.524999999999863 | 16.398 | 22.19 | 33.058 |
| 3.529999999999863 | 16.462 | 22.262 | 33.14 |
| 3.534999999999862 | 16.527 | 22.333 | 33.222 |
| 3.539999999999862 | 16.592 | 22.405 | 33.304 |
| 3.544999999999862 | 16.657 | 22.477 | 33.386 |
| 3.549999999999862 | 16.723 | 22.55 | 33.468 |
| 3.554999999999862 | 16.788 | 22.622 | 33.551 |
| 3.559999999999862 | 16.854 | 22.695 | 33.634 |
| 3.564999999999862 | 16.92 | 22.767 | 33.717 |
| 3.569999999999862 | 16.986 | 22.84 | 33.8 |
| 3.574999999999862 | 17.052 | 22.913 | 33.883 |
| 3.579999999999862 | 17.119 | 22.987 | 33.967 |
| 3.584999999999861 | 17.185 | 23.06 | 34.05 |
| 3.589999999999861 | 17.252 | 23.134 | 34.134 |
| 3.594999999999861 | 17.319 | 23.208 | 34.218 |
| 3.599999999999861 | 17.386 | 23.282 | 34.303 |
| 3.604999999999861 | 17.454 | 23.356 | 34.387 |
| 3.609999999999861 | 17.521 | 23.43 | 34.472 |
| 3.614999999999861 | 17.589 | 23.505 | 34.557 |
| 3.619999999999861 | 17.657 | 23.58 | 34.642 |
| 3.62499999999986 | 17.725 | 23.655 | 34.727 |
| 3.62999999999986 | 17.793 | 23.73 | 34.812 |
| 3.63499999999986 | 17.861 | 23.805 | 34.898 |
| 3.63999999999986 | 17.93 | 23.881 | 34.983 |
| 3.64499999999986 | 17.999 | 23.956 | 35.069 |
| 3.64999999999986 | 18.068 | 24.032 | 35.155 |
| 3.65499999999986 | 18.137 | 24.108 | 35.242 |
| 3.65999999999986 | 18.206 | 24.185 | 35.328 |
| 3.66499999999986 | 18.276 | 24.261 | 35.415 |
| 3.669999999999859 | 18.346 | 24.338 | 35.502 |
| 3.674999999999859 | 18.415 | 24.414 | 35.589 |
| 3.679999999999859 | 18.486 | 24.491 | 35.676 |
| 3.684999999999859 | 18.556 | 24.568 | 35.764 |
| 3.689999999999859 | 18.626 | 24.646 | 35.851 |
| 3.694999999999859 | 18.697 | 24.723 | 35.939 |
| 3.699999999999859 | 18.768 | 24.801 | 36.027 |
| 3.704999999999859 | 18.839 | 24.879 | 36.115 |
| 3.709999999999859 | 18.91 | 24.957 | 36.204 |
| 3.714999999999859 | 18.981 | 25.035 | 36.292 |
| 3.719999999999858 | 19.053 | 25.114 | 36.381 |
| 3.724999999999858 | 19.125 | 25.192 | 36.47 |
| 3.729999999999858 | 19.196 | 25.271 | 36.559 |
| 3.734999999999858 | 19.269 | 25.35 | 36.649 |
| 3.739999999999858 | 19.341 | 25.43 | 36.738 |
| 3.744999999999858 | 19.413 | 25.509 | 36.828 |
| 3.749999999999858 | 19.486 | 25.589 | 36.918 |
| 3.754999999999858 | 19.559 | 25.668 | 37.008 |
| 3.759999999999858 | 19.632 | 25.748 | 37.098 |
| 3.764999999999857 | 19.705 | 25.828 | 37.189 |
| 3.769999999999857 | 19.779 | 25.909 | 37.28 |
| 3.774999999999857 | 19.852 | 25.989 | 37.371 |
| 3.779999999999857 | 19.926 | 26.07 | 37.462 |
| 3.784999999999857 | 20 | 26.151 | 37.553 |
| 3.789999999999857 | 20.074 | 26.232 | 37.645 |
| 3.794999999999857 | 20.149 | 26.313 | 37.736 |
| 3.799999999999857 | 20.223 | 26.395 | 37.828 |
| 3.804999999999857 | 20.298 | 26.477 | 37.92 |
| 3.809999999999857 | 20.373 | 26.558 | 38.013 |
| 3.814999999999856 | 20.448 | 26.641 | 38.105 |
| 3.819999999999856 | 20.523 | 26.723 | 38.198 |
| 3.824999999999856 | 20.599 | 26.805 | 38.291 |
| 3.829999999999856 | 20.675 | 26.888 | 38.384 |
| 3.834999999999856 | 20.75 | 26.971 | 38.477 |
| 3.839999999999856 | 20.827 | 27.054 | 38.57 |
| 3.844999999999856 | 20.903 | 27.137 | 38.664 |
| 3.849999999999856 | 20.979 | 27.22 | 38.758 |
| 3.854999999999856 | 21.056 | 27.304 | 38.852 |
| 3.859999999999855 | 21.133 | 27.388 | 38.946 |
| 3.864999999999855 | 21.21 | 27.472 | 39.041 |
| 3.869999999999855 | 21.287 | 27.556 | 39.135 |
| 3.874999999999855 | 21.365 | 27.64 | 39.23 |
| 3.879999999999855 | 21.442 | 27.725 | 39.325 |
| 3.884999999999855 | 21.52 | 27.81 | 39.42 |
| 3.889999999999855 | 21.598 | 27.895 | 39.516 |
| 3.894999999999855 | 21.676 | 27.98 | 39.612 |
| 3.899999999999855 | 21.755 | 28.065 | 39.707 |
| 3.904999999999855 | 21.833 | 28.151 | 39.803 |
| 3.909999999999854 | 21.912 | 28.237 | 39.9 |
| 3.914999999999854 | 21.991 | 28.323 | 39.996 |
| 3.919999999999854 | 22.07 | 28.409 | 40.093 |
| 3.924999999999854 | 22.15 | 28.495 | 40.19 |
| 3.929999999999854 | 22.229 | 28.582 | 40.287 |
| 3.934999999999854 | 22.309 | 28.668 | 40.384 |
| 3.939999999999854 | 22.389 | 28.755 | 40.481 |
| 3.944999999999854 | 22.469 | 28.842 | 40.579 |
| 3.949999999999854 | 22.55 | 28.93 | 40.677 |
| 3.954999999999853 | 22.63 | 29.017 | 40.775 |
| 3.959999999999853 | 22.711 | 29.105 | 40.873 |
| 3.964999999999853 | 22.792 | 29.193 | 40.972 |
| 3.969999999999853 | 22.873 | 29.281 | 41.07 |
| 3.974999999999853 | 22.954 | 29.37 | 41.169 |
| 3.979999999999853 | 23.036 | 29.458 | 41.268 |
| 3.984999999999853 | 23.118 | 29.547 | 41.368 |
| 3.989999999999853 | 23.2 | 29.636 | 41.467 |
| 3.994999999999853 | 23.282 | 29.725 | 41.567 |
| 3.999999999999853 | 23.364 | 29.814 | 41.667 |
| 4.004999999999852 | 23.447 | 29.904 | 41.767 |
| 4.009999999999852 | 23.53 | 29.994 | 41.867 |
| 4.014999999999852 | 23.613 | 30.083 | 41.968 |
| 4.019999999999852 | 23.696 | 30.174 | 42.068 |
| 4.024999999999852 | 23.779 | 30.264 | 42.169 |
| 4.029999999999852 | 23.863 | 30.355 | 42.27 |
| 4.034999999999852 | 23.946 | 30.445 | 42.372 |
| 4.039999999999851 | 24.03 | 30.536 | 42.473 |
| 4.044999999999852 | 24.115 | 30.627 | 42.575 |
| 4.049999999999851 | 24.199 | 30.719 | 42.677 |
| 4.054999999999851 | 24.284 | 30.81 | 42.779 |
| 4.059999999999851 | 24.368 | 30.902 | 42.881 |
| 4.064999999999851 | 24.453 | 30.994 | 42.984 |
| 4.069999999999851 | 24.538 | 31.086 | 43.087 |
| 4.074999999999851 | 24.624 | 31.179 | 43.19 |
| 4.07999999999985 | 24.709 | 31.271 | 43.293 |
| 4.084999999999851 | 24.795 | 31.364 | 43.396 |
| 4.08999999999985 | 24.881 | 31.457 | 43.5 |
| 4.094999999999851 | 24.967 | 31.55 | 43.604 |
| 4.09999999999985 | 25.054 | 31.644 | 43.708 |
| 4.10499999999985 | 25.14 | 31.737 | 43.812 |
| 4.10999999999985 | 25.227 | 31.831 | 43.917 |
| 4.11499999999985 | 25.314 | 31.925 | 44.021 |
| 4.11999999999985 | 25.402 | 32.019 | 44.126 |
| 4.12499999999985 | 25.489 | 32.114 | 44.231 |
| 4.12999999999985 | 25.577 | 32.208 | 44.337 |
| 4.13499999999985 | 25.664 | 32.303 | 44.442 |
| 4.13999999999985 | 25.753 | 32.398 | 44.548 |
| 4.144999999999849 | 25.841 | 32.494 | 44.654 |
| 4.14999999999985 | 25.929 | 32.589 | 44.76 |
| 4.154999999999849 | 26.018 | 32.685 | 44.866 |
| 4.15999999999985 | 26.107 | 32.781 | 44.973 |
| 4.164999999999849 | 26.196 | 32.877 | 45.08 |
| 4.169999999999849 | 26.285 | 32.973 | 45.187 |
| 4.174999999999849 | 26.375 | 33.07 | 45.294 |
| 4.179999999999848 | 26.465 | 33.166 | 45.401 |
| 4.184999999999849 | 26.554 | 33.263 | 45.509 |
| 4.189999999999848 | 26.645 | 33.361 | 45.617 |
| 4.194999999999848 | 26.735 | 33.458 | 45.725 |
| 4.199999999999848 | 26.825 | 33.556 | 45.833 |
| 4.204999999999848 | 26.916 | 33.653 | 45.942 |
| 4.209999999999848 | 27.007 | 33.751 | 46.05 |
| 4.214999999999848 | 27.098 | 33.85 | 46.159 |
| 4.219999999999847 | 27.19 | 33.948 | 46.268 |
| 4.224999999999848 | 27.281 | 34.047 | 46.378 |
| 4.229999999999847 | 27.373 | 34.146 | 46.487 |
| 4.234999999999847 | 27.465 | 34.245 | 46.597 |
| 4.239999999999847 | 27.558 | 34.344 | 46.707 |
| 4.244999999999847 | 27.65 | 34.443 | 46.817 |
| 4.249999999999847 | 27.743 | 34.543 | 46.928 |
| 4.254999999999847 | 27.836 | 34.643 | 47.038 |
| 4.259999999999846 | 27.929 | 34.743 | 47.149 |
| 4.264999999999847 | 28.022 | 34.843 | 47.26 |
| 4.269999999999846 | 28.116 | 34.944 | 47.372 |
| 4.274999999999846 | 28.209 | 35.045 | 47.483 |
| 4.279999999999846 | 28.303 | 35.146 | 47.595 |
| 4.284999999999846 | 28.397 | 35.247 | 47.707 |
| 4.289999999999846 | 28.492 | 35.348 | 47.819 |
| 4.294999999999846 | 28.586 | 35.45 | 47.932 |
| 4.299999999999846 | 28.681 | 35.552 | 48.044 |
| 4.304999999999846 | 28.776 | 35.654 | 48.157 |
| 4.309999999999845 | 28.871 | 35.756 | 48.27 |
| 4.314999999999846 | 28.967 | 35.859 | 48.383 |
| 4.319999999999845 | 29.063 | 35.961 | 48.497 |
| 4.324999999999846 | 29.158 | 36.064 | 48.611 |
| 4.329999999999845 | 29.255 | 36.168 | 48.725 |
| 4.334999999999845 | 29.351 | 36.271 | 48.839 |
| 4.339999999999845 | 29.447 | 36.375 | 48.953 |
| 4.344999999999845 | 29.544 | 36.478 | 49.068 |
| 4.349999999999845 | 29.641 | 36.582 | 49.182 |
| 4.354999999999845 | 29.738 | 36.687 | 49.297 |
| 4.359999999999844 | 29.836 | 36.791 | 49.413 |
| 4.364999999999845 | 29.933 | 36.896 | 49.528 |
| 4.369999999999844 | 30.031 | 37.001 | 49.644 |
| 4.374999999999844 | 30.129 | 37.106 | 49.76 |
| 4.379999999999844 | 30.228 | 37.211 | 49.876 |
| 4.384999999999844 | 30.326 | 37.317 | 49.992 |
| 4.389999999999844 | 30.425 | 37.422 | 50.109 |
| 4.394999999999844 | 30.524 | 37.528 | 50.226 |
| 4.399999999999844 | 30.623 | 37.635 | 50.343 |
| 4.404999999999844 | 30.722 | 37.741 | 50.46 |
| 4.409999999999843 | 30.822 | 37.848 | 50.578 |
| 4.414999999999844 | 30.922 | 37.955 | 50.695 |
| 4.419999999999843 | 31.022 | 38.062 | 50.813 |
| 4.424999999999843 | 31.122 | 38.169 | 50.931 |
| 4.429999999999843 | 31.222 | 38.277 | 51.05 |
| 4.434999999999843 | 31.323 | 38.384 | 51.168 |
| 4.439999999999843 | 31.424 | 38.492 | 51.287 |
| 4.444999999999843 | 31.525 | 38.601 | 51.406 |
| 4.449999999999842 | 31.627 | 38.709 | 51.526 |
| 4.454999999999843 | 31.728 | 38.818 | 51.645 |
| 4.459999999999842 | 31.83 | 38.927 | 51.765 |
| 4.464999999999843 | 31.932 | 39.036 | 51.885 |
| 4.469999999999842 | 32.034 | 39.145 | 52.005 |
| 4.474999999999842 | 32.137 | 39.255 | 52.126 |
| 4.479999999999842 | 32.239 | 39.364 | 52.246 |
| 4.484999999999842 | 32.342 | 39.474 | 52.367 |
| 4.489999999999842 | 32.446 | 39.585 | 52.488 |
| 4.494999999999842 | 32.549 | 39.695 | 52.61 |
| 4.499999999999841 | 32.653 | 39.806 | 52.731 |
| 4.504999999999842 | 32.756 | 39.917 | 52.853 |
| 4.509999999999841 | 32.86 | 40.028 | 52.975 |
| 4.514999999999842 | 32.965 | 40.139 | 53.097 |
| 4.519999999999841 | 33.069 | 40.251 | 53.22 |
| 4.524999999999841 | 33.174 | 40.363 | 53.342 |
| 4.529999999999841 | 33.279 | 40.475 | 53.465 |
| 4.534999999999841 | 33.384 | 40.587 | 53.589 |
| 4.53999999999984 | 33.49 | 40.699 | 53.712 |
| 4.544999999999841 | 33.595 | 40.812 | 53.836 |
| 4.54999999999984 | 33.701 | 40.925 | 53.96 |
| 4.554999999999841 | 33.807 | 41.038 | 54.084 |
| 4.55999999999984 | 33.913 | 41.152 | 54.208 |
| 4.564999999999841 | 34.02 | 41.265 | 54.333 |
| 4.56999999999984 | 34.127 | 41.379 | 54.457 |
| 4.57499999999984 | 34.234 | 41.493 | 54.582 |
| 4.57999999999984 | 34.341 | 41.608 | 54.708 |
| 4.58499999999984 | 34.449 | 41.722 | 54.833 |
| 4.58999999999984 | 34.556 | 41.837 | 54.959 |
| 4.59499999999984 | 34.664 | 41.952 | 55.085 |
| 4.59999999999984 | 34.772 | 42.067 | 55.211 |
| 4.60499999999984 | 34.881 | 42.183 | 55.337 |
| 4.60999999999984 | 34.989 | 42.299 | 55.464 |
| 4.614999999999839 | 35.098 | 42.414 | 55.591 |
| 4.61999999999984 | 35.207 | 42.531 | 55.718 |
| 4.624999999999839 | 35.317 | 42.647 | 55.846 |
| 4.62999999999984 | 35.426 | 42.764 | 55.973 |
| 4.634999999999839 | 35.536 | 42.881 | 56.101 |
| 4.639999999999838 | 35.646 | 42.998 | 56.229 |
| 4.644999999999839 | 35.756 | 43.115 | 56.357 |
| 4.649999999999838 | 35.867 | 43.233 | 56.486 |
| 4.654999999999839 | 35.977 | 43.35 | 56.615 |
| 4.659999999999838 | 36.088 | 43.468 | 56.744 |
| 4.664999999999838 | 36.199 | 43.587 | 56.873 |
| 4.669999999999838 | 36.311 | 43.705 | 57.002 |
| 4.674999999999838 | 36.422 | 43.824 | 57.132 |
| 4.679999999999837 | 36.534 | 43.943 | 57.262 |
| 4.684999999999838 | 36.646 | 44.062 | 57.392 |
| 4.689999999999837 | 36.759 | 44.182 | 57.523 |
| 4.694999999999838 | 36.871 | 44.301 | 57.653 |
| 4.699999999999837 | 36.984 | 44.421 | 57.784 |
| 4.704999999999837 | 37.097 | 44.541 | 57.915 |
| 4.709999999999837 | 37.21 | 44.662 | 58.047 |
| 4.714999999999837 | 37.324 | 44.782 | 58.178 |
| 4.719999999999837 | 37.438 | 44.903 | 58.31 |
| 4.724999999999837 | 37.552 | 45.024 | 58.442 |
| 4.729999999999836 | 37.666 | 45.146 | 58.575 |
| 4.734999999999836 | 37.78 | 45.267 | 58.707 |
| 4.739999999999836 | 37.895 | 45.389 | 58.84 |
| 4.744999999999836 | 38.01 | 45.511 | 58.973 |
| 4.749999999999836 | 38.125 | 45.633 | 59.107 |
| 4.754999999999836 | 38.24 | 45.756 | 59.24 |
| 4.759999999999836 | 38.356 | 45.879 | 59.374 |
| 4.764999999999836 | 38.472 | 46.002 | 59.508 |
| 4.769999999999836 | 38.588 | 46.125 | 59.642 |
| 4.774999999999835 | 38.704 | 46.248 | 59.777 |
| 4.779999999999835 | 38.821 | 46.372 | 59.911 |
| 4.784999999999835 | 38.938 | 46.496 | 60.046 |
| 4.789999999999835 | 39.055 | 46.62 | 60.182 |
| 4.794999999999835 | 39.172 | 46.745 | 60.317 |
| 4.799999999999835 | 39.29 | 46.869 | 60.453 |
| 4.804999999999835 | 39.408 | 46.994 | 60.589 |
| 4.809999999999835 | 39.526 | 47.119 | 60.725 |
| 4.814999999999835 | 39.644 | 47.245 | 60.862 |
| 4.819999999999835 | 39.762 | 47.37 | 60.998 |
| 4.824999999999835 | 39.881 | 47.496 | 61.135 |
| 4.829999999999834 | 40 | 47.622 | 61.272 |
| 4.834999999999834 | 40.119 | 47.749 | 61.41 |
| 4.839999999999834 | 40.239 | 47.875 | 61.548 |
| 4.844999999999834 | 40.359 | 48.002 | 61.685 |
| 4.849999999999834 | 40.479 | 48.129 | 61.824 |
| 4.854999999999834 | 40.599 | 48.257 | 61.962 |
| 4.859999999999834 | 40.719 | 48.384 | 62.101 |
| 4.864999999999834 | 40.84 | 48.512 | 62.24 |
| 4.869999999999834 | 40.961 | 48.64 | 62.379 |
| 4.874999999999834 | 41.082 | 48.769 | 62.518 |
| 4.879999999999833 | 41.204 | 48.897 | 62.658 |
| 4.884999999999834 | 41.325 | 49.026 | 62.798 |
| 4.889999999999833 | 41.447 | 49.155 | 62.938 |
| 4.894999999999833 | 41.569 | 49.284 | 63.078 |
| 4.899999999999833 | 41.692 | 49.414 | 63.219 |
| 4.904999999999833 | 41.814 | 49.544 | 63.36 |
| 4.909999999999833 | 41.937 | 49.674 | 63.501 |
| 4.914999999999833 | 42.06 | 49.804 | 63.642 |
| 4.919999999999832 | 42.184 | 49.934 | 63.784 |
| 4.924999999999833 | 42.307 | 50.065 | 63.926 |
| 4.929999999999832 | 42.431 | 50.196 | 64.068 |
| 4.934999999999832 | 42.555 | 50.328 | 64.21 |
| 4.939999999999832 | 42.68 | 50.459 | 64.353 |
| 4.944999999999832 | 42.804 | 50.591 | 64.496 |
| 4.949999999999832 | 42.929 | 50.723 | 64.639 |
| 4.954999999999832 | 43.054 | 50.855 | 64.782 |
| 4.959999999999832 | 43.18 | 50.988 | 64.926 |
| 4.964999999999832 | 43.305 | 51.12 | 65.07 |
| 4.969999999999831 | 43.431 | 51.253 | 65.214 |
| 4.974999999999831 | 43.557 | 51.387 | 65.358 |
| 4.97999999999983 | 43.684 | 51.52 | 65.503 |
| 4.984999999999831 | 43.81 | 51.654 | 65.648 |
| 4.98999999999983 | 43.937 | 51.788 | 65.793 |
| 4.994999999999831 | 44.064 | 51.922 | 65.938 |
| 4.99999999999983 | 44.192 | 52.057 | 66.084 |